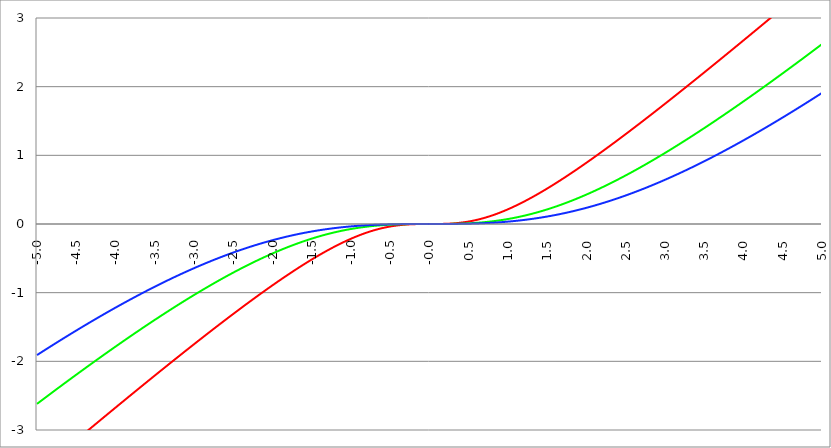
| Category | Series 1 | Series 0 | Series 2 |
|---|---|---|---|
| -5.0 | -3.627 | -2.619 | -1.909 |
| -4.995 | -3.622 | -2.615 | -1.905 |
| -4.99 | -3.617 | -2.611 | -1.902 |
| -4.985 | -3.612 | -2.606 | -1.898 |
| -4.98 | -3.607 | -2.602 | -1.894 |
| -4.975 | -3.603 | -2.598 | -1.891 |
| -4.97 | -3.598 | -2.594 | -1.887 |
| -4.965000000000001 | -3.593 | -2.589 | -1.883 |
| -4.960000000000001 | -3.588 | -2.585 | -1.88 |
| -4.955000000000001 | -3.583 | -2.581 | -1.876 |
| -4.950000000000001 | -3.579 | -2.576 | -1.872 |
| -4.945000000000001 | -3.574 | -2.572 | -1.869 |
| -4.940000000000001 | -3.569 | -2.568 | -1.865 |
| -4.935000000000001 | -3.564 | -2.563 | -1.861 |
| -4.930000000000001 | -3.559 | -2.559 | -1.858 |
| -4.925000000000002 | -3.555 | -2.555 | -1.854 |
| -4.920000000000002 | -3.55 | -2.551 | -1.85 |
| -4.915000000000002 | -3.545 | -2.546 | -1.847 |
| -4.910000000000002 | -3.54 | -2.542 | -1.843 |
| -4.905000000000002 | -3.535 | -2.538 | -1.839 |
| -4.900000000000002 | -3.531 | -2.533 | -1.836 |
| -4.895000000000002 | -3.526 | -2.529 | -1.832 |
| -4.890000000000002 | -3.521 | -2.525 | -1.828 |
| -4.885000000000002 | -3.516 | -2.521 | -1.825 |
| -4.880000000000002 | -3.511 | -2.516 | -1.821 |
| -4.875000000000003 | -3.507 | -2.512 | -1.818 |
| -4.870000000000003 | -3.502 | -2.508 | -1.814 |
| -4.865000000000003 | -3.497 | -2.503 | -1.81 |
| -4.860000000000003 | -3.492 | -2.499 | -1.807 |
| -4.855000000000003 | -3.487 | -2.495 | -1.803 |
| -4.850000000000003 | -3.483 | -2.491 | -1.799 |
| -4.845000000000003 | -3.478 | -2.486 | -1.796 |
| -4.840000000000003 | -3.473 | -2.482 | -1.792 |
| -4.835000000000003 | -3.468 | -2.478 | -1.789 |
| -4.830000000000004 | -3.463 | -2.474 | -1.785 |
| -4.825000000000004 | -3.459 | -2.469 | -1.781 |
| -4.820000000000004 | -3.454 | -2.465 | -1.778 |
| -4.815000000000004 | -3.449 | -2.461 | -1.774 |
| -4.810000000000004 | -3.444 | -2.457 | -1.771 |
| -4.805000000000004 | -3.439 | -2.452 | -1.767 |
| -4.800000000000004 | -3.435 | -2.448 | -1.763 |
| -4.795000000000004 | -3.43 | -2.444 | -1.76 |
| -4.790000000000004 | -3.425 | -2.439 | -1.756 |
| -4.785000000000004 | -3.42 | -2.435 | -1.753 |
| -4.780000000000004 | -3.415 | -2.431 | -1.749 |
| -4.775000000000004 | -3.411 | -2.427 | -1.745 |
| -4.770000000000004 | -3.406 | -2.422 | -1.742 |
| -4.765000000000005 | -3.401 | -2.418 | -1.738 |
| -4.760000000000005 | -3.396 | -2.414 | -1.735 |
| -4.755000000000005 | -3.391 | -2.41 | -1.731 |
| -4.750000000000005 | -3.387 | -2.405 | -1.728 |
| -4.745000000000005 | -3.382 | -2.401 | -1.724 |
| -4.740000000000005 | -3.377 | -2.397 | -1.72 |
| -4.735000000000005 | -3.372 | -2.393 | -1.717 |
| -4.730000000000005 | -3.368 | -2.388 | -1.713 |
| -4.725000000000006 | -3.363 | -2.384 | -1.71 |
| -4.720000000000006 | -3.358 | -2.38 | -1.706 |
| -4.715000000000006 | -3.353 | -2.376 | -1.703 |
| -4.710000000000006 | -3.348 | -2.372 | -1.699 |
| -4.705000000000006 | -3.344 | -2.367 | -1.695 |
| -4.700000000000006 | -3.339 | -2.363 | -1.692 |
| -4.695000000000006 | -3.334 | -2.359 | -1.688 |
| -4.690000000000006 | -3.329 | -2.355 | -1.685 |
| -4.685000000000007 | -3.324 | -2.35 | -1.681 |
| -4.680000000000007 | -3.32 | -2.346 | -1.678 |
| -4.675000000000007 | -3.315 | -2.342 | -1.674 |
| -4.670000000000007 | -3.31 | -2.338 | -1.671 |
| -4.665000000000007 | -3.305 | -2.333 | -1.667 |
| -4.660000000000007 | -3.301 | -2.329 | -1.664 |
| -4.655000000000007 | -3.296 | -2.325 | -1.66 |
| -4.650000000000007 | -3.291 | -2.321 | -1.657 |
| -4.645000000000007 | -3.286 | -2.317 | -1.653 |
| -4.640000000000008 | -3.281 | -2.312 | -1.649 |
| -4.635000000000008 | -3.277 | -2.308 | -1.646 |
| -4.630000000000008 | -3.272 | -2.304 | -1.642 |
| -4.625000000000008 | -3.267 | -2.3 | -1.639 |
| -4.620000000000008 | -3.262 | -2.295 | -1.635 |
| -4.615000000000008 | -3.258 | -2.291 | -1.632 |
| -4.610000000000008 | -3.253 | -2.287 | -1.628 |
| -4.605000000000008 | -3.248 | -2.283 | -1.625 |
| -4.600000000000008 | -3.243 | -2.279 | -1.621 |
| -4.595000000000009 | -3.238 | -2.274 | -1.618 |
| -4.590000000000009 | -3.234 | -2.27 | -1.614 |
| -4.585000000000009 | -3.229 | -2.266 | -1.611 |
| -4.580000000000009 | -3.224 | -2.262 | -1.607 |
| -4.57500000000001 | -3.219 | -2.258 | -1.604 |
| -4.57000000000001 | -3.215 | -2.253 | -1.6 |
| -4.565000000000009 | -3.21 | -2.249 | -1.597 |
| -4.560000000000009 | -3.205 | -2.245 | -1.593 |
| -4.555000000000009 | -3.2 | -2.241 | -1.59 |
| -4.55000000000001 | -3.196 | -2.237 | -1.586 |
| -4.54500000000001 | -3.191 | -2.232 | -1.583 |
| -4.54000000000001 | -3.186 | -2.228 | -1.579 |
| -4.53500000000001 | -3.181 | -2.224 | -1.576 |
| -4.53000000000001 | -3.176 | -2.22 | -1.572 |
| -4.52500000000001 | -3.172 | -2.216 | -1.569 |
| -4.52000000000001 | -3.167 | -2.212 | -1.565 |
| -4.51500000000001 | -3.162 | -2.207 | -1.562 |
| -4.51000000000001 | -3.157 | -2.203 | -1.559 |
| -4.505000000000011 | -3.153 | -2.199 | -1.555 |
| -4.500000000000011 | -3.148 | -2.195 | -1.552 |
| -4.495000000000011 | -3.143 | -2.191 | -1.548 |
| -4.490000000000011 | -3.138 | -2.187 | -1.545 |
| -4.485000000000011 | -3.134 | -2.182 | -1.541 |
| -4.480000000000011 | -3.129 | -2.178 | -1.538 |
| -4.475000000000011 | -3.124 | -2.174 | -1.534 |
| -4.470000000000011 | -3.119 | -2.17 | -1.531 |
| -4.465000000000011 | -3.115 | -2.166 | -1.527 |
| -4.460000000000011 | -3.11 | -2.162 | -1.524 |
| -4.455000000000012 | -3.105 | -2.157 | -1.521 |
| -4.450000000000012 | -3.1 | -2.153 | -1.517 |
| -4.445000000000012 | -3.095 | -2.149 | -1.514 |
| -4.440000000000012 | -3.091 | -2.145 | -1.51 |
| -4.435000000000012 | -3.086 | -2.141 | -1.507 |
| -4.430000000000012 | -3.081 | -2.137 | -1.503 |
| -4.425000000000012 | -3.076 | -2.132 | -1.5 |
| -4.420000000000012 | -3.072 | -2.128 | -1.497 |
| -4.415000000000012 | -3.067 | -2.124 | -1.493 |
| -4.410000000000013 | -3.062 | -2.12 | -1.49 |
| -4.405000000000013 | -3.057 | -2.116 | -1.486 |
| -4.400000000000013 | -3.053 | -2.112 | -1.483 |
| -4.395000000000013 | -3.048 | -2.108 | -1.479 |
| -4.390000000000013 | -3.043 | -2.103 | -1.476 |
| -4.385000000000013 | -3.038 | -2.099 | -1.473 |
| -4.380000000000013 | -3.034 | -2.095 | -1.469 |
| -4.375000000000013 | -3.029 | -2.091 | -1.466 |
| -4.370000000000013 | -3.024 | -2.087 | -1.462 |
| -4.365000000000013 | -3.019 | -2.083 | -1.459 |
| -4.360000000000014 | -3.015 | -2.079 | -1.456 |
| -4.355000000000014 | -3.01 | -2.074 | -1.452 |
| -4.350000000000014 | -3.005 | -2.07 | -1.449 |
| -4.345000000000014 | -3 | -2.066 | -1.445 |
| -4.340000000000014 | -2.996 | -2.062 | -1.442 |
| -4.335000000000014 | -2.991 | -2.058 | -1.439 |
| -4.330000000000014 | -2.986 | -2.054 | -1.435 |
| -4.325000000000014 | -2.981 | -2.05 | -1.432 |
| -4.320000000000014 | -2.977 | -2.046 | -1.429 |
| -4.315000000000015 | -2.972 | -2.041 | -1.425 |
| -4.310000000000015 | -2.967 | -2.037 | -1.422 |
| -4.305000000000015 | -2.962 | -2.033 | -1.418 |
| -4.300000000000015 | -2.958 | -2.029 | -1.415 |
| -4.295000000000015 | -2.953 | -2.025 | -1.412 |
| -4.290000000000015 | -2.948 | -2.021 | -1.408 |
| -4.285000000000015 | -2.943 | -2.017 | -1.405 |
| -4.280000000000015 | -2.939 | -2.013 | -1.402 |
| -4.275000000000015 | -2.934 | -2.009 | -1.398 |
| -4.270000000000015 | -2.929 | -2.004 | -1.395 |
| -4.265000000000016 | -2.925 | -2 | -1.392 |
| -4.260000000000016 | -2.92 | -1.996 | -1.388 |
| -4.255000000000016 | -2.915 | -1.992 | -1.385 |
| -4.250000000000016 | -2.91 | -1.988 | -1.382 |
| -4.245000000000016 | -2.906 | -1.984 | -1.378 |
| -4.240000000000016 | -2.901 | -1.98 | -1.375 |
| -4.235000000000016 | -2.896 | -1.976 | -1.372 |
| -4.230000000000016 | -2.891 | -1.972 | -1.368 |
| -4.225000000000017 | -2.887 | -1.968 | -1.365 |
| -4.220000000000017 | -2.882 | -1.964 | -1.362 |
| -4.215000000000017 | -2.877 | -1.959 | -1.358 |
| -4.210000000000017 | -2.872 | -1.955 | -1.355 |
| -4.205000000000017 | -2.868 | -1.951 | -1.352 |
| -4.200000000000017 | -2.863 | -1.947 | -1.348 |
| -4.195000000000017 | -2.858 | -1.943 | -1.345 |
| -4.190000000000017 | -2.853 | -1.939 | -1.342 |
| -4.185000000000017 | -2.849 | -1.935 | -1.338 |
| -4.180000000000017 | -2.844 | -1.931 | -1.335 |
| -4.175000000000018 | -2.839 | -1.927 | -1.332 |
| -4.170000000000018 | -2.835 | -1.923 | -1.329 |
| -4.165000000000018 | -2.83 | -1.919 | -1.325 |
| -4.160000000000018 | -2.825 | -1.915 | -1.322 |
| -4.155000000000018 | -2.82 | -1.911 | -1.319 |
| -4.150000000000018 | -2.816 | -1.907 | -1.315 |
| -4.145000000000018 | -2.811 | -1.903 | -1.312 |
| -4.140000000000018 | -2.806 | -1.898 | -1.309 |
| -4.135000000000018 | -2.801 | -1.894 | -1.306 |
| -4.130000000000019 | -2.797 | -1.89 | -1.302 |
| -4.125000000000019 | -2.792 | -1.886 | -1.299 |
| -4.120000000000019 | -2.787 | -1.882 | -1.296 |
| -4.115000000000019 | -2.783 | -1.878 | -1.292 |
| -4.110000000000019 | -2.778 | -1.874 | -1.289 |
| -4.105000000000019 | -2.773 | -1.87 | -1.286 |
| -4.100000000000019 | -2.768 | -1.866 | -1.283 |
| -4.095000000000019 | -2.764 | -1.862 | -1.279 |
| -4.090000000000019 | -2.759 | -1.858 | -1.276 |
| -4.085000000000019 | -2.754 | -1.854 | -1.273 |
| -4.08000000000002 | -2.75 | -1.85 | -1.27 |
| -4.07500000000002 | -2.745 | -1.846 | -1.266 |
| -4.07000000000002 | -2.74 | -1.842 | -1.263 |
| -4.06500000000002 | -2.735 | -1.838 | -1.26 |
| -4.06000000000002 | -2.731 | -1.834 | -1.257 |
| -4.05500000000002 | -2.726 | -1.83 | -1.253 |
| -4.05000000000002 | -2.721 | -1.826 | -1.25 |
| -4.04500000000002 | -2.717 | -1.822 | -1.247 |
| -4.04000000000002 | -2.712 | -1.818 | -1.244 |
| -4.03500000000002 | -2.707 | -1.814 | -1.241 |
| -4.03000000000002 | -2.702 | -1.81 | -1.237 |
| -4.025000000000021 | -2.698 | -1.806 | -1.234 |
| -4.020000000000021 | -2.693 | -1.802 | -1.231 |
| -4.015000000000021 | -2.688 | -1.798 | -1.228 |
| -4.010000000000021 | -2.684 | -1.794 | -1.225 |
| -4.005000000000021 | -2.679 | -1.79 | -1.221 |
| -4.000000000000021 | -2.674 | -1.786 | -1.218 |
| -3.995000000000021 | -2.669 | -1.782 | -1.215 |
| -3.990000000000021 | -2.665 | -1.778 | -1.212 |
| -3.985000000000022 | -2.66 | -1.774 | -1.209 |
| -3.980000000000022 | -2.655 | -1.77 | -1.205 |
| -3.975000000000022 | -2.651 | -1.766 | -1.202 |
| -3.970000000000022 | -2.646 | -1.762 | -1.199 |
| -3.965000000000022 | -2.641 | -1.758 | -1.196 |
| -3.960000000000022 | -2.637 | -1.754 | -1.193 |
| -3.955000000000022 | -2.632 | -1.75 | -1.189 |
| -3.950000000000022 | -2.627 | -1.746 | -1.186 |
| -3.945000000000022 | -2.622 | -1.742 | -1.183 |
| -3.940000000000023 | -2.618 | -1.738 | -1.18 |
| -3.935000000000023 | -2.613 | -1.734 | -1.177 |
| -3.930000000000023 | -2.608 | -1.73 | -1.174 |
| -3.925000000000023 | -2.604 | -1.726 | -1.17 |
| -3.920000000000023 | -2.599 | -1.722 | -1.167 |
| -3.915000000000023 | -2.594 | -1.718 | -1.164 |
| -3.910000000000023 | -2.59 | -1.714 | -1.161 |
| -3.905000000000023 | -2.585 | -1.71 | -1.158 |
| -3.900000000000023 | -2.58 | -1.706 | -1.155 |
| -3.895000000000023 | -2.576 | -1.702 | -1.152 |
| -3.890000000000024 | -2.571 | -1.698 | -1.148 |
| -3.885000000000024 | -2.566 | -1.694 | -1.145 |
| -3.880000000000024 | -2.561 | -1.69 | -1.142 |
| -3.875000000000024 | -2.557 | -1.686 | -1.139 |
| -3.870000000000024 | -2.552 | -1.682 | -1.136 |
| -3.865000000000024 | -2.547 | -1.678 | -1.133 |
| -3.860000000000024 | -2.543 | -1.675 | -1.13 |
| -3.855000000000024 | -2.538 | -1.671 | -1.127 |
| -3.850000000000024 | -2.533 | -1.667 | -1.123 |
| -3.845000000000025 | -2.529 | -1.663 | -1.12 |
| -3.840000000000025 | -2.524 | -1.659 | -1.117 |
| -3.835000000000025 | -2.519 | -1.655 | -1.114 |
| -3.830000000000025 | -2.515 | -1.651 | -1.111 |
| -3.825000000000025 | -2.51 | -1.647 | -1.108 |
| -3.820000000000025 | -2.505 | -1.643 | -1.105 |
| -3.815000000000025 | -2.501 | -1.639 | -1.102 |
| -3.810000000000025 | -2.496 | -1.635 | -1.099 |
| -3.805000000000025 | -2.491 | -1.631 | -1.096 |
| -3.800000000000026 | -2.487 | -1.627 | -1.092 |
| -3.795000000000026 | -2.482 | -1.623 | -1.089 |
| -3.790000000000026 | -2.477 | -1.62 | -1.086 |
| -3.785000000000026 | -2.473 | -1.616 | -1.083 |
| -3.780000000000026 | -2.468 | -1.612 | -1.08 |
| -3.775000000000026 | -2.463 | -1.608 | -1.077 |
| -3.770000000000026 | -2.458 | -1.604 | -1.074 |
| -3.765000000000026 | -2.454 | -1.6 | -1.071 |
| -3.760000000000026 | -2.449 | -1.596 | -1.068 |
| -3.755000000000026 | -2.444 | -1.592 | -1.065 |
| -3.750000000000027 | -2.44 | -1.588 | -1.062 |
| -3.745000000000027 | -2.435 | -1.584 | -1.059 |
| -3.740000000000027 | -2.43 | -1.581 | -1.056 |
| -3.735000000000027 | -2.426 | -1.577 | -1.053 |
| -3.730000000000027 | -2.421 | -1.573 | -1.05 |
| -3.725000000000027 | -2.416 | -1.569 | -1.047 |
| -3.720000000000027 | -2.412 | -1.565 | -1.044 |
| -3.715000000000027 | -2.407 | -1.561 | -1.041 |
| -3.710000000000027 | -2.402 | -1.557 | -1.038 |
| -3.705000000000028 | -2.398 | -1.553 | -1.035 |
| -3.700000000000028 | -2.393 | -1.55 | -1.032 |
| -3.695000000000028 | -2.389 | -1.546 | -1.028 |
| -3.690000000000028 | -2.384 | -1.542 | -1.025 |
| -3.685000000000028 | -2.379 | -1.538 | -1.022 |
| -3.680000000000028 | -2.375 | -1.534 | -1.019 |
| -3.675000000000028 | -2.37 | -1.53 | -1.016 |
| -3.670000000000028 | -2.365 | -1.526 | -1.013 |
| -3.665000000000028 | -2.361 | -1.522 | -1.01 |
| -3.660000000000028 | -2.356 | -1.519 | -1.007 |
| -3.655000000000029 | -2.351 | -1.515 | -1.004 |
| -3.650000000000029 | -2.347 | -1.511 | -1.002 |
| -3.645000000000029 | -2.342 | -1.507 | -0.999 |
| -3.640000000000029 | -2.337 | -1.503 | -0.996 |
| -3.635000000000029 | -2.333 | -1.499 | -0.993 |
| -3.630000000000029 | -2.328 | -1.496 | -0.99 |
| -3.625000000000029 | -2.323 | -1.492 | -0.987 |
| -3.620000000000029 | -2.319 | -1.488 | -0.984 |
| -3.615000000000029 | -2.314 | -1.484 | -0.981 |
| -3.61000000000003 | -2.309 | -1.48 | -0.978 |
| -3.60500000000003 | -2.305 | -1.476 | -0.975 |
| -3.60000000000003 | -2.3 | -1.473 | -0.972 |
| -3.59500000000003 | -2.296 | -1.469 | -0.969 |
| -3.59000000000003 | -2.291 | -1.465 | -0.966 |
| -3.58500000000003 | -2.286 | -1.461 | -0.963 |
| -3.58000000000003 | -2.282 | -1.457 | -0.96 |
| -3.57500000000003 | -2.277 | -1.454 | -0.957 |
| -3.57000000000003 | -2.272 | -1.45 | -0.954 |
| -3.565000000000031 | -2.268 | -1.446 | -0.951 |
| -3.560000000000031 | -2.263 | -1.442 | -0.948 |
| -3.555000000000031 | -2.258 | -1.438 | -0.945 |
| -3.550000000000031 | -2.254 | -1.435 | -0.942 |
| -3.545000000000031 | -2.249 | -1.431 | -0.94 |
| -3.540000000000031 | -2.245 | -1.427 | -0.937 |
| -3.535000000000031 | -2.24 | -1.423 | -0.934 |
| -3.530000000000031 | -2.235 | -1.419 | -0.931 |
| -3.525000000000031 | -2.231 | -1.416 | -0.928 |
| -3.520000000000032 | -2.226 | -1.412 | -0.925 |
| -3.515000000000032 | -2.221 | -1.408 | -0.922 |
| -3.510000000000032 | -2.217 | -1.404 | -0.919 |
| -3.505000000000032 | -2.212 | -1.4 | -0.916 |
| -3.500000000000032 | -2.208 | -1.397 | -0.913 |
| -3.495000000000032 | -2.203 | -1.393 | -0.911 |
| -3.490000000000032 | -2.198 | -1.389 | -0.908 |
| -3.485000000000032 | -2.194 | -1.385 | -0.905 |
| -3.480000000000032 | -2.189 | -1.382 | -0.902 |
| -3.475000000000032 | -2.184 | -1.378 | -0.899 |
| -3.470000000000033 | -2.18 | -1.374 | -0.896 |
| -3.465000000000033 | -2.175 | -1.37 | -0.893 |
| -3.460000000000033 | -2.171 | -1.367 | -0.891 |
| -3.455000000000033 | -2.166 | -1.363 | -0.888 |
| -3.450000000000033 | -2.161 | -1.359 | -0.885 |
| -3.445000000000033 | -2.157 | -1.355 | -0.882 |
| -3.440000000000033 | -2.152 | -1.352 | -0.879 |
| -3.435000000000033 | -2.147 | -1.348 | -0.876 |
| -3.430000000000033 | -2.143 | -1.344 | -0.873 |
| -3.425000000000034 | -2.138 | -1.34 | -0.871 |
| -3.420000000000034 | -2.134 | -1.337 | -0.868 |
| -3.415000000000034 | -2.129 | -1.333 | -0.865 |
| -3.410000000000034 | -2.124 | -1.329 | -0.862 |
| -3.405000000000034 | -2.12 | -1.326 | -0.859 |
| -3.400000000000034 | -2.115 | -1.322 | -0.857 |
| -3.395000000000034 | -2.111 | -1.318 | -0.854 |
| -3.390000000000034 | -2.106 | -1.314 | -0.851 |
| -3.385000000000034 | -2.101 | -1.311 | -0.848 |
| -3.380000000000034 | -2.097 | -1.307 | -0.845 |
| -3.375000000000035 | -2.092 | -1.303 | -0.843 |
| -3.370000000000035 | -2.088 | -1.3 | -0.84 |
| -3.365000000000035 | -2.083 | -1.296 | -0.837 |
| -3.360000000000035 | -2.078 | -1.292 | -0.834 |
| -3.355000000000035 | -2.074 | -1.289 | -0.831 |
| -3.350000000000035 | -2.069 | -1.285 | -0.829 |
| -3.345000000000035 | -2.065 | -1.281 | -0.826 |
| -3.340000000000035 | -2.06 | -1.277 | -0.823 |
| -3.335000000000035 | -2.056 | -1.274 | -0.82 |
| -3.330000000000036 | -2.051 | -1.27 | -0.818 |
| -3.325000000000036 | -2.046 | -1.266 | -0.815 |
| -3.320000000000036 | -2.042 | -1.263 | -0.812 |
| -3.315000000000036 | -2.037 | -1.259 | -0.809 |
| -3.310000000000036 | -2.033 | -1.255 | -0.807 |
| -3.305000000000036 | -2.028 | -1.252 | -0.804 |
| -3.300000000000036 | -2.023 | -1.248 | -0.801 |
| -3.295000000000036 | -2.019 | -1.244 | -0.798 |
| -3.290000000000036 | -2.014 | -1.241 | -0.796 |
| -3.285000000000036 | -2.01 | -1.237 | -0.793 |
| -3.280000000000036 | -2.005 | -1.234 | -0.79 |
| -3.275000000000037 | -2.001 | -1.23 | -0.787 |
| -3.270000000000037 | -1.996 | -1.226 | -0.785 |
| -3.265000000000037 | -1.991 | -1.223 | -0.782 |
| -3.260000000000037 | -1.987 | -1.219 | -0.779 |
| -3.255000000000037 | -1.982 | -1.215 | -0.777 |
| -3.250000000000037 | -1.978 | -1.212 | -0.774 |
| -3.245000000000037 | -1.973 | -1.208 | -0.771 |
| -3.240000000000037 | -1.969 | -1.204 | -0.768 |
| -3.235000000000038 | -1.964 | -1.201 | -0.766 |
| -3.230000000000038 | -1.959 | -1.197 | -0.763 |
| -3.225000000000038 | -1.955 | -1.194 | -0.76 |
| -3.220000000000038 | -1.95 | -1.19 | -0.758 |
| -3.215000000000038 | -1.946 | -1.186 | -0.755 |
| -3.210000000000038 | -1.941 | -1.183 | -0.752 |
| -3.205000000000038 | -1.937 | -1.179 | -0.75 |
| -3.200000000000038 | -1.932 | -1.176 | -0.747 |
| -3.195000000000038 | -1.928 | -1.172 | -0.744 |
| -3.190000000000039 | -1.923 | -1.168 | -0.742 |
| -3.185000000000039 | -1.918 | -1.165 | -0.739 |
| -3.180000000000039 | -1.914 | -1.161 | -0.736 |
| -3.175000000000039 | -1.909 | -1.158 | -0.734 |
| -3.170000000000039 | -1.905 | -1.154 | -0.731 |
| -3.16500000000004 | -1.9 | -1.151 | -0.729 |
| -3.16000000000004 | -1.896 | -1.147 | -0.726 |
| -3.155000000000039 | -1.891 | -1.143 | -0.723 |
| -3.150000000000039 | -1.887 | -1.14 | -0.721 |
| -3.14500000000004 | -1.882 | -1.136 | -0.718 |
| -3.14000000000004 | -1.878 | -1.133 | -0.715 |
| -3.13500000000004 | -1.873 | -1.129 | -0.713 |
| -3.13000000000004 | -1.868 | -1.126 | -0.71 |
| -3.12500000000004 | -1.864 | -1.122 | -0.708 |
| -3.12000000000004 | -1.859 | -1.118 | -0.705 |
| -3.11500000000004 | -1.855 | -1.115 | -0.702 |
| -3.11000000000004 | -1.85 | -1.111 | -0.7 |
| -3.10500000000004 | -1.846 | -1.108 | -0.697 |
| -3.10000000000004 | -1.841 | -1.104 | -0.695 |
| -3.095000000000041 | -1.837 | -1.101 | -0.692 |
| -3.090000000000041 | -1.832 | -1.097 | -0.689 |
| -3.085000000000041 | -1.828 | -1.094 | -0.687 |
| -3.080000000000041 | -1.823 | -1.09 | -0.684 |
| -3.075000000000041 | -1.819 | -1.087 | -0.682 |
| -3.070000000000041 | -1.814 | -1.083 | -0.679 |
| -3.065000000000041 | -1.81 | -1.08 | -0.677 |
| -3.060000000000041 | -1.805 | -1.076 | -0.674 |
| -3.055000000000041 | -1.801 | -1.073 | -0.672 |
| -3.050000000000042 | -1.796 | -1.069 | -0.669 |
| -3.045000000000042 | -1.792 | -1.066 | -0.666 |
| -3.040000000000042 | -1.787 | -1.062 | -0.664 |
| -3.035000000000042 | -1.782 | -1.059 | -0.661 |
| -3.030000000000042 | -1.778 | -1.055 | -0.659 |
| -3.025000000000042 | -1.773 | -1.052 | -0.656 |
| -3.020000000000042 | -1.769 | -1.048 | -0.654 |
| -3.015000000000042 | -1.764 | -1.045 | -0.651 |
| -3.010000000000042 | -1.76 | -1.041 | -0.649 |
| -3.005000000000043 | -1.755 | -1.038 | -0.646 |
| -3.000000000000043 | -1.751 | -1.034 | -0.644 |
| -2.995000000000043 | -1.746 | -1.031 | -0.641 |
| -2.990000000000043 | -1.742 | -1.027 | -0.639 |
| -2.985000000000043 | -1.737 | -1.024 | -0.636 |
| -2.980000000000043 | -1.733 | -1.021 | -0.634 |
| -2.975000000000043 | -1.728 | -1.017 | -0.631 |
| -2.970000000000043 | -1.724 | -1.014 | -0.629 |
| -2.965000000000043 | -1.719 | -1.01 | -0.626 |
| -2.960000000000043 | -1.715 | -1.007 | -0.624 |
| -2.955000000000044 | -1.711 | -1.003 | -0.621 |
| -2.950000000000044 | -1.706 | -1 | -0.619 |
| -2.945000000000044 | -1.702 | -0.997 | -0.617 |
| -2.940000000000044 | -1.697 | -0.993 | -0.614 |
| -2.935000000000044 | -1.693 | -0.99 | -0.612 |
| -2.930000000000044 | -1.688 | -0.986 | -0.609 |
| -2.925000000000044 | -1.684 | -0.983 | -0.607 |
| -2.920000000000044 | -1.679 | -0.979 | -0.604 |
| -2.915000000000044 | -1.675 | -0.976 | -0.602 |
| -2.910000000000045 | -1.67 | -0.973 | -0.599 |
| -2.905000000000045 | -1.666 | -0.969 | -0.597 |
| -2.900000000000045 | -1.661 | -0.966 | -0.595 |
| -2.895000000000045 | -1.657 | -0.963 | -0.592 |
| -2.890000000000045 | -1.652 | -0.959 | -0.59 |
| -2.885000000000045 | -1.648 | -0.956 | -0.587 |
| -2.880000000000045 | -1.643 | -0.952 | -0.585 |
| -2.875000000000045 | -1.639 | -0.949 | -0.583 |
| -2.870000000000045 | -1.634 | -0.946 | -0.58 |
| -2.865000000000045 | -1.63 | -0.942 | -0.578 |
| -2.860000000000046 | -1.626 | -0.939 | -0.575 |
| -2.855000000000046 | -1.621 | -0.936 | -0.573 |
| -2.850000000000046 | -1.617 | -0.932 | -0.571 |
| -2.845000000000046 | -1.612 | -0.929 | -0.568 |
| -2.840000000000046 | -1.608 | -0.926 | -0.566 |
| -2.835000000000046 | -1.603 | -0.922 | -0.564 |
| -2.830000000000046 | -1.599 | -0.919 | -0.561 |
| -2.825000000000046 | -1.594 | -0.916 | -0.559 |
| -2.820000000000046 | -1.59 | -0.912 | -0.557 |
| -2.815000000000047 | -1.586 | -0.909 | -0.554 |
| -2.810000000000047 | -1.581 | -0.906 | -0.552 |
| -2.805000000000047 | -1.577 | -0.902 | -0.55 |
| -2.800000000000047 | -1.572 | -0.899 | -0.547 |
| -2.795000000000047 | -1.568 | -0.896 | -0.545 |
| -2.790000000000047 | -1.563 | -0.892 | -0.543 |
| -2.785000000000047 | -1.559 | -0.889 | -0.54 |
| -2.780000000000047 | -1.555 | -0.886 | -0.538 |
| -2.775000000000047 | -1.55 | -0.882 | -0.536 |
| -2.770000000000047 | -1.546 | -0.879 | -0.533 |
| -2.765000000000048 | -1.541 | -0.876 | -0.531 |
| -2.760000000000048 | -1.537 | -0.873 | -0.529 |
| -2.755000000000048 | -1.532 | -0.869 | -0.526 |
| -2.750000000000048 | -1.528 | -0.866 | -0.524 |
| -2.745000000000048 | -1.524 | -0.863 | -0.522 |
| -2.740000000000048 | -1.519 | -0.859 | -0.52 |
| -2.735000000000048 | -1.515 | -0.856 | -0.517 |
| -2.730000000000048 | -1.51 | -0.853 | -0.515 |
| -2.725000000000048 | -1.506 | -0.85 | -0.513 |
| -2.720000000000049 | -1.502 | -0.846 | -0.511 |
| -2.715000000000049 | -1.497 | -0.843 | -0.508 |
| -2.710000000000049 | -1.493 | -0.84 | -0.506 |
| -2.705000000000049 | -1.488 | -0.837 | -0.504 |
| -2.700000000000049 | -1.484 | -0.834 | -0.502 |
| -2.695000000000049 | -1.48 | -0.83 | -0.499 |
| -2.690000000000049 | -1.475 | -0.827 | -0.497 |
| -2.685000000000049 | -1.471 | -0.824 | -0.495 |
| -2.680000000000049 | -1.466 | -0.821 | -0.493 |
| -2.675000000000049 | -1.462 | -0.817 | -0.49 |
| -2.67000000000005 | -1.458 | -0.814 | -0.488 |
| -2.66500000000005 | -1.453 | -0.811 | -0.486 |
| -2.66000000000005 | -1.449 | -0.808 | -0.484 |
| -2.65500000000005 | -1.444 | -0.805 | -0.482 |
| -2.65000000000005 | -1.44 | -0.801 | -0.479 |
| -2.64500000000005 | -1.436 | -0.798 | -0.477 |
| -2.64000000000005 | -1.431 | -0.795 | -0.475 |
| -2.63500000000005 | -1.427 | -0.792 | -0.473 |
| -2.63000000000005 | -1.423 | -0.789 | -0.471 |
| -2.625000000000051 | -1.418 | -0.786 | -0.469 |
| -2.620000000000051 | -1.414 | -0.782 | -0.466 |
| -2.615000000000051 | -1.409 | -0.779 | -0.464 |
| -2.610000000000051 | -1.405 | -0.776 | -0.462 |
| -2.605000000000051 | -1.401 | -0.773 | -0.46 |
| -2.600000000000051 | -1.396 | -0.77 | -0.458 |
| -2.595000000000051 | -1.392 | -0.767 | -0.456 |
| -2.590000000000051 | -1.388 | -0.764 | -0.453 |
| -2.585000000000051 | -1.383 | -0.76 | -0.451 |
| -2.580000000000052 | -1.379 | -0.757 | -0.449 |
| -2.575000000000052 | -1.375 | -0.754 | -0.447 |
| -2.570000000000052 | -1.37 | -0.751 | -0.445 |
| -2.565000000000052 | -1.366 | -0.748 | -0.443 |
| -2.560000000000052 | -1.362 | -0.745 | -0.441 |
| -2.555000000000052 | -1.357 | -0.742 | -0.439 |
| -2.550000000000052 | -1.353 | -0.739 | -0.437 |
| -2.545000000000052 | -1.349 | -0.736 | -0.434 |
| -2.540000000000052 | -1.344 | -0.732 | -0.432 |
| -2.535000000000053 | -1.34 | -0.729 | -0.43 |
| -2.530000000000053 | -1.336 | -0.726 | -0.428 |
| -2.525000000000053 | -1.331 | -0.723 | -0.426 |
| -2.520000000000053 | -1.327 | -0.72 | -0.424 |
| -2.515000000000053 | -1.323 | -0.717 | -0.422 |
| -2.510000000000053 | -1.318 | -0.714 | -0.42 |
| -2.505000000000053 | -1.314 | -0.711 | -0.418 |
| -2.500000000000053 | -1.31 | -0.708 | -0.416 |
| -2.495000000000053 | -1.305 | -0.705 | -0.414 |
| -2.490000000000053 | -1.301 | -0.702 | -0.412 |
| -2.485000000000054 | -1.297 | -0.699 | -0.41 |
| -2.480000000000054 | -1.292 | -0.696 | -0.408 |
| -2.475000000000054 | -1.288 | -0.693 | -0.406 |
| -2.470000000000054 | -1.284 | -0.69 | -0.404 |
| -2.465000000000054 | -1.28 | -0.687 | -0.402 |
| -2.460000000000054 | -1.275 | -0.684 | -0.4 |
| -2.455000000000054 | -1.271 | -0.681 | -0.398 |
| -2.450000000000054 | -1.267 | -0.678 | -0.396 |
| -2.445000000000054 | -1.262 | -0.675 | -0.394 |
| -2.440000000000055 | -1.258 | -0.672 | -0.392 |
| -2.435000000000055 | -1.254 | -0.669 | -0.39 |
| -2.430000000000055 | -1.25 | -0.666 | -0.388 |
| -2.425000000000055 | -1.245 | -0.663 | -0.386 |
| -2.420000000000055 | -1.241 | -0.66 | -0.384 |
| -2.415000000000055 | -1.237 | -0.657 | -0.382 |
| -2.410000000000055 | -1.233 | -0.654 | -0.38 |
| -2.405000000000055 | -1.228 | -0.651 | -0.378 |
| -2.400000000000055 | -1.224 | -0.648 | -0.376 |
| -2.395000000000055 | -1.22 | -0.645 | -0.374 |
| -2.390000000000056 | -1.215 | -0.642 | -0.372 |
| -2.385000000000056 | -1.211 | -0.639 | -0.37 |
| -2.380000000000056 | -1.207 | -0.636 | -0.368 |
| -2.375000000000056 | -1.203 | -0.633 | -0.366 |
| -2.370000000000056 | -1.198 | -0.63 | -0.364 |
| -2.365000000000056 | -1.194 | -0.627 | -0.362 |
| -2.360000000000056 | -1.19 | -0.624 | -0.36 |
| -2.355000000000056 | -1.186 | -0.622 | -0.358 |
| -2.350000000000056 | -1.182 | -0.619 | -0.357 |
| -2.345000000000057 | -1.177 | -0.616 | -0.355 |
| -2.340000000000057 | -1.173 | -0.613 | -0.353 |
| -2.335000000000057 | -1.169 | -0.61 | -0.351 |
| -2.330000000000057 | -1.165 | -0.607 | -0.349 |
| -2.325000000000057 | -1.16 | -0.604 | -0.347 |
| -2.320000000000057 | -1.156 | -0.601 | -0.345 |
| -2.315000000000057 | -1.152 | -0.598 | -0.343 |
| -2.310000000000057 | -1.148 | -0.596 | -0.341 |
| -2.305000000000057 | -1.144 | -0.593 | -0.34 |
| -2.300000000000058 | -1.139 | -0.59 | -0.338 |
| -2.295000000000058 | -1.135 | -0.587 | -0.336 |
| -2.290000000000058 | -1.131 | -0.584 | -0.334 |
| -2.285000000000058 | -1.127 | -0.581 | -0.332 |
| -2.280000000000058 | -1.123 | -0.579 | -0.33 |
| -2.275000000000058 | -1.118 | -0.576 | -0.329 |
| -2.270000000000058 | -1.114 | -0.573 | -0.327 |
| -2.265000000000058 | -1.11 | -0.57 | -0.325 |
| -2.260000000000058 | -1.106 | -0.567 | -0.323 |
| -2.255000000000058 | -1.102 | -0.564 | -0.321 |
| -2.250000000000059 | -1.097 | -0.562 | -0.319 |
| -2.245000000000059 | -1.093 | -0.559 | -0.318 |
| -2.240000000000059 | -1.089 | -0.556 | -0.316 |
| -2.235000000000059 | -1.085 | -0.553 | -0.314 |
| -2.23000000000006 | -1.081 | -0.551 | -0.312 |
| -2.22500000000006 | -1.077 | -0.548 | -0.311 |
| -2.22000000000006 | -1.072 | -0.545 | -0.309 |
| -2.215000000000059 | -1.068 | -0.542 | -0.307 |
| -2.210000000000059 | -1.064 | -0.54 | -0.305 |
| -2.20500000000006 | -1.06 | -0.537 | -0.304 |
| -2.20000000000006 | -1.056 | -0.534 | -0.302 |
| -2.19500000000006 | -1.052 | -0.531 | -0.3 |
| -2.19000000000006 | -1.048 | -0.529 | -0.298 |
| -2.18500000000006 | -1.043 | -0.526 | -0.297 |
| -2.18000000000006 | -1.039 | -0.523 | -0.295 |
| -2.17500000000006 | -1.035 | -0.52 | -0.293 |
| -2.17000000000006 | -1.031 | -0.518 | -0.291 |
| -2.16500000000006 | -1.027 | -0.515 | -0.29 |
| -2.160000000000061 | -1.023 | -0.512 | -0.288 |
| -2.155000000000061 | -1.019 | -0.51 | -0.286 |
| -2.150000000000061 | -1.015 | -0.507 | -0.285 |
| -2.145000000000061 | -1.01 | -0.504 | -0.283 |
| -2.140000000000061 | -1.006 | -0.502 | -0.281 |
| -2.135000000000061 | -1.002 | -0.499 | -0.279 |
| -2.130000000000061 | -0.998 | -0.496 | -0.278 |
| -2.125000000000061 | -0.994 | -0.494 | -0.276 |
| -2.120000000000061 | -0.99 | -0.491 | -0.274 |
| -2.115000000000061 | -0.986 | -0.488 | -0.273 |
| -2.110000000000062 | -0.982 | -0.486 | -0.271 |
| -2.105000000000062 | -0.978 | -0.483 | -0.269 |
| -2.100000000000062 | -0.974 | -0.48 | -0.268 |
| -2.095000000000062 | -0.97 | -0.478 | -0.266 |
| -2.090000000000062 | -0.965 | -0.475 | -0.265 |
| -2.085000000000062 | -0.961 | -0.473 | -0.263 |
| -2.080000000000062 | -0.957 | -0.47 | -0.261 |
| -2.075000000000062 | -0.953 | -0.467 | -0.26 |
| -2.070000000000062 | -0.949 | -0.465 | -0.258 |
| -2.065000000000063 | -0.945 | -0.462 | -0.256 |
| -2.060000000000063 | -0.941 | -0.46 | -0.255 |
| -2.055000000000063 | -0.937 | -0.457 | -0.253 |
| -2.050000000000063 | -0.933 | -0.455 | -0.252 |
| -2.045000000000063 | -0.929 | -0.452 | -0.25 |
| -2.040000000000063 | -0.925 | -0.449 | -0.248 |
| -2.035000000000063 | -0.921 | -0.447 | -0.247 |
| -2.030000000000063 | -0.917 | -0.444 | -0.245 |
| -2.025000000000063 | -0.913 | -0.442 | -0.244 |
| -2.020000000000064 | -0.909 | -0.439 | -0.242 |
| -2.015000000000064 | -0.905 | -0.437 | -0.241 |
| -2.010000000000064 | -0.901 | -0.434 | -0.239 |
| -2.005000000000064 | -0.897 | -0.432 | -0.238 |
| -2.000000000000064 | -0.893 | -0.429 | -0.236 |
| -1.995000000000064 | -0.889 | -0.427 | -0.234 |
| -1.990000000000064 | -0.885 | -0.424 | -0.233 |
| -1.985000000000064 | -0.881 | -0.422 | -0.231 |
| -1.980000000000064 | -0.877 | -0.419 | -0.23 |
| -1.975000000000064 | -0.873 | -0.417 | -0.228 |
| -1.970000000000065 | -0.869 | -0.414 | -0.227 |
| -1.965000000000065 | -0.865 | -0.412 | -0.225 |
| -1.960000000000065 | -0.861 | -0.409 | -0.224 |
| -1.955000000000065 | -0.857 | -0.407 | -0.222 |
| -1.950000000000065 | -0.853 | -0.405 | -0.221 |
| -1.945000000000065 | -0.849 | -0.402 | -0.219 |
| -1.940000000000065 | -0.845 | -0.4 | -0.218 |
| -1.935000000000065 | -0.841 | -0.397 | -0.216 |
| -1.930000000000065 | -0.837 | -0.395 | -0.215 |
| -1.925000000000066 | -0.833 | -0.392 | -0.214 |
| -1.920000000000066 | -0.829 | -0.39 | -0.212 |
| -1.915000000000066 | -0.825 | -0.388 | -0.211 |
| -1.910000000000066 | -0.822 | -0.385 | -0.209 |
| -1.905000000000066 | -0.818 | -0.383 | -0.208 |
| -1.900000000000066 | -0.814 | -0.38 | -0.206 |
| -1.895000000000066 | -0.81 | -0.378 | -0.205 |
| -1.890000000000066 | -0.806 | -0.376 | -0.203 |
| -1.885000000000066 | -0.802 | -0.373 | -0.202 |
| -1.880000000000066 | -0.798 | -0.371 | -0.201 |
| -1.875000000000067 | -0.794 | -0.369 | -0.199 |
| -1.870000000000067 | -0.79 | -0.366 | -0.198 |
| -1.865000000000067 | -0.786 | -0.364 | -0.196 |
| -1.860000000000067 | -0.783 | -0.362 | -0.195 |
| -1.855000000000067 | -0.779 | -0.359 | -0.194 |
| -1.850000000000067 | -0.775 | -0.357 | -0.192 |
| -1.845000000000067 | -0.771 | -0.355 | -0.191 |
| -1.840000000000067 | -0.767 | -0.352 | -0.19 |
| -1.835000000000067 | -0.763 | -0.35 | -0.188 |
| -1.830000000000068 | -0.759 | -0.348 | -0.187 |
| -1.825000000000068 | -0.755 | -0.346 | -0.185 |
| -1.820000000000068 | -0.752 | -0.343 | -0.184 |
| -1.815000000000068 | -0.748 | -0.341 | -0.183 |
| -1.810000000000068 | -0.744 | -0.339 | -0.181 |
| -1.805000000000068 | -0.74 | -0.337 | -0.18 |
| -1.800000000000068 | -0.736 | -0.334 | -0.179 |
| -1.795000000000068 | -0.732 | -0.332 | -0.177 |
| -1.790000000000068 | -0.729 | -0.33 | -0.176 |
| -1.785000000000068 | -0.725 | -0.328 | -0.175 |
| -1.780000000000069 | -0.721 | -0.325 | -0.173 |
| -1.775000000000069 | -0.717 | -0.323 | -0.172 |
| -1.770000000000069 | -0.713 | -0.321 | -0.171 |
| -1.765000000000069 | -0.71 | -0.319 | -0.17 |
| -1.760000000000069 | -0.706 | -0.317 | -0.168 |
| -1.75500000000007 | -0.702 | -0.315 | -0.167 |
| -1.75000000000007 | -0.698 | -0.312 | -0.166 |
| -1.745000000000069 | -0.695 | -0.31 | -0.165 |
| -1.740000000000069 | -0.691 | -0.308 | -0.163 |
| -1.73500000000007 | -0.687 | -0.306 | -0.162 |
| -1.73000000000007 | -0.683 | -0.304 | -0.161 |
| -1.72500000000007 | -0.68 | -0.302 | -0.159 |
| -1.72000000000007 | -0.676 | -0.299 | -0.158 |
| -1.71500000000007 | -0.672 | -0.297 | -0.157 |
| -1.71000000000007 | -0.668 | -0.295 | -0.156 |
| -1.70500000000007 | -0.665 | -0.293 | -0.155 |
| -1.70000000000007 | -0.661 | -0.291 | -0.153 |
| -1.69500000000007 | -0.657 | -0.289 | -0.152 |
| -1.69000000000007 | -0.654 | -0.287 | -0.151 |
| -1.685000000000071 | -0.65 | -0.285 | -0.15 |
| -1.680000000000071 | -0.646 | -0.283 | -0.149 |
| -1.675000000000071 | -0.642 | -0.281 | -0.147 |
| -1.670000000000071 | -0.639 | -0.279 | -0.146 |
| -1.665000000000071 | -0.635 | -0.277 | -0.145 |
| -1.660000000000071 | -0.631 | -0.274 | -0.144 |
| -1.655000000000071 | -0.628 | -0.272 | -0.143 |
| -1.650000000000071 | -0.624 | -0.27 | -0.141 |
| -1.645000000000071 | -0.62 | -0.268 | -0.14 |
| -1.640000000000072 | -0.617 | -0.266 | -0.139 |
| -1.635000000000072 | -0.613 | -0.264 | -0.138 |
| -1.630000000000072 | -0.609 | -0.262 | -0.137 |
| -1.625000000000072 | -0.606 | -0.26 | -0.136 |
| -1.620000000000072 | -0.602 | -0.258 | -0.135 |
| -1.615000000000072 | -0.599 | -0.256 | -0.133 |
| -1.610000000000072 | -0.595 | -0.254 | -0.132 |
| -1.605000000000072 | -0.591 | -0.252 | -0.131 |
| -1.600000000000072 | -0.588 | -0.251 | -0.13 |
| -1.595000000000073 | -0.584 | -0.249 | -0.129 |
| -1.590000000000073 | -0.581 | -0.247 | -0.128 |
| -1.585000000000073 | -0.577 | -0.245 | -0.127 |
| -1.580000000000073 | -0.573 | -0.243 | -0.126 |
| -1.575000000000073 | -0.57 | -0.241 | -0.125 |
| -1.570000000000073 | -0.566 | -0.239 | -0.124 |
| -1.565000000000073 | -0.563 | -0.237 | -0.123 |
| -1.560000000000073 | -0.559 | -0.235 | -0.121 |
| -1.555000000000073 | -0.556 | -0.233 | -0.12 |
| -1.550000000000074 | -0.552 | -0.231 | -0.119 |
| -1.545000000000074 | -0.549 | -0.23 | -0.118 |
| -1.540000000000074 | -0.545 | -0.228 | -0.117 |
| -1.535000000000074 | -0.542 | -0.226 | -0.116 |
| -1.530000000000074 | -0.538 | -0.224 | -0.115 |
| -1.525000000000074 | -0.535 | -0.222 | -0.114 |
| -1.520000000000074 | -0.531 | -0.22 | -0.113 |
| -1.515000000000074 | -0.528 | -0.218 | -0.112 |
| -1.510000000000074 | -0.524 | -0.217 | -0.111 |
| -1.505000000000074 | -0.521 | -0.215 | -0.11 |
| -1.500000000000075 | -0.517 | -0.213 | -0.109 |
| -1.495000000000075 | -0.514 | -0.211 | -0.108 |
| -1.490000000000075 | -0.51 | -0.209 | -0.107 |
| -1.485000000000075 | -0.507 | -0.208 | -0.106 |
| -1.480000000000075 | -0.503 | -0.206 | -0.105 |
| -1.475000000000075 | -0.5 | -0.204 | -0.104 |
| -1.470000000000075 | -0.497 | -0.202 | -0.103 |
| -1.465000000000075 | -0.493 | -0.201 | -0.102 |
| -1.460000000000075 | -0.49 | -0.199 | -0.101 |
| -1.455000000000076 | -0.486 | -0.197 | -0.1 |
| -1.450000000000076 | -0.483 | -0.195 | -0.099 |
| -1.445000000000076 | -0.48 | -0.194 | -0.098 |
| -1.440000000000076 | -0.476 | -0.192 | -0.097 |
| -1.435000000000076 | -0.473 | -0.19 | -0.097 |
| -1.430000000000076 | -0.469 | -0.189 | -0.096 |
| -1.425000000000076 | -0.466 | -0.187 | -0.095 |
| -1.420000000000076 | -0.463 | -0.185 | -0.094 |
| -1.415000000000076 | -0.459 | -0.184 | -0.093 |
| -1.410000000000077 | -0.456 | -0.182 | -0.092 |
| -1.405000000000077 | -0.453 | -0.18 | -0.091 |
| -1.400000000000077 | -0.449 | -0.179 | -0.09 |
| -1.395000000000077 | -0.446 | -0.177 | -0.089 |
| -1.390000000000077 | -0.443 | -0.175 | -0.088 |
| -1.385000000000077 | -0.44 | -0.174 | -0.087 |
| -1.380000000000077 | -0.436 | -0.172 | -0.087 |
| -1.375000000000077 | -0.433 | -0.17 | -0.086 |
| -1.370000000000077 | -0.43 | -0.169 | -0.085 |
| -1.365000000000077 | -0.426 | -0.167 | -0.084 |
| -1.360000000000078 | -0.423 | -0.166 | -0.083 |
| -1.355000000000078 | -0.42 | -0.164 | -0.082 |
| -1.350000000000078 | -0.417 | -0.163 | -0.081 |
| -1.345000000000078 | -0.414 | -0.161 | -0.081 |
| -1.340000000000078 | -0.41 | -0.159 | -0.08 |
| -1.335000000000078 | -0.407 | -0.158 | -0.079 |
| -1.330000000000078 | -0.404 | -0.156 | -0.078 |
| -1.325000000000078 | -0.401 | -0.155 | -0.077 |
| -1.320000000000078 | -0.398 | -0.153 | -0.076 |
| -1.315000000000079 | -0.394 | -0.152 | -0.076 |
| -1.310000000000079 | -0.391 | -0.15 | -0.075 |
| -1.305000000000079 | -0.388 | -0.149 | -0.074 |
| -1.300000000000079 | -0.385 | -0.147 | -0.073 |
| -1.295000000000079 | -0.382 | -0.146 | -0.072 |
| -1.29000000000008 | -0.379 | -0.144 | -0.072 |
| -1.285000000000079 | -0.376 | -0.143 | -0.071 |
| -1.280000000000079 | -0.372 | -0.141 | -0.07 |
| -1.275000000000079 | -0.369 | -0.14 | -0.069 |
| -1.270000000000079 | -0.366 | -0.138 | -0.069 |
| -1.26500000000008 | -0.363 | -0.137 | -0.068 |
| -1.26000000000008 | -0.36 | -0.136 | -0.067 |
| -1.25500000000008 | -0.357 | -0.134 | -0.066 |
| -1.25000000000008 | -0.354 | -0.133 | -0.066 |
| -1.24500000000008 | -0.351 | -0.131 | -0.065 |
| -1.24000000000008 | -0.348 | -0.13 | -0.064 |
| -1.23500000000008 | -0.345 | -0.129 | -0.063 |
| -1.23000000000008 | -0.342 | -0.127 | -0.063 |
| -1.22500000000008 | -0.339 | -0.126 | -0.062 |
| -1.220000000000081 | -0.336 | -0.125 | -0.061 |
| -1.215000000000081 | -0.333 | -0.123 | -0.061 |
| -1.210000000000081 | -0.33 | -0.122 | -0.06 |
| -1.205000000000081 | -0.327 | -0.12 | -0.059 |
| -1.200000000000081 | -0.324 | -0.119 | -0.058 |
| -1.195000000000081 | -0.321 | -0.118 | -0.058 |
| -1.190000000000081 | -0.318 | -0.117 | -0.057 |
| -1.185000000000081 | -0.315 | -0.115 | -0.056 |
| -1.180000000000081 | -0.312 | -0.114 | -0.056 |
| -1.175000000000082 | -0.309 | -0.113 | -0.055 |
| -1.170000000000082 | -0.306 | -0.111 | -0.054 |
| -1.165000000000082 | -0.304 | -0.11 | -0.054 |
| -1.160000000000082 | -0.301 | -0.109 | -0.053 |
| -1.155000000000082 | -0.298 | -0.108 | -0.052 |
| -1.150000000000082 | -0.295 | -0.106 | -0.052 |
| -1.145000000000082 | -0.292 | -0.105 | -0.051 |
| -1.140000000000082 | -0.289 | -0.104 | -0.051 |
| -1.135000000000082 | -0.286 | -0.103 | -0.05 |
| -1.130000000000082 | -0.284 | -0.101 | -0.049 |
| -1.125000000000083 | -0.281 | -0.1 | -0.049 |
| -1.120000000000083 | -0.278 | -0.099 | -0.048 |
| -1.115000000000083 | -0.275 | -0.098 | -0.047 |
| -1.110000000000083 | -0.273 | -0.097 | -0.047 |
| -1.105000000000083 | -0.27 | -0.095 | -0.046 |
| -1.100000000000083 | -0.267 | -0.094 | -0.046 |
| -1.095000000000083 | -0.264 | -0.093 | -0.045 |
| -1.090000000000083 | -0.262 | -0.092 | -0.044 |
| -1.085000000000083 | -0.259 | -0.091 | -0.044 |
| -1.080000000000084 | -0.256 | -0.09 | -0.043 |
| -1.075000000000084 | -0.253 | -0.089 | -0.043 |
| -1.070000000000084 | -0.251 | -0.087 | -0.042 |
| -1.065000000000084 | -0.248 | -0.086 | -0.042 |
| -1.060000000000084 | -0.245 | -0.085 | -0.041 |
| -1.055000000000084 | -0.243 | -0.084 | -0.041 |
| -1.050000000000084 | -0.24 | -0.083 | -0.04 |
| -1.045000000000084 | -0.238 | -0.082 | -0.039 |
| -1.040000000000084 | -0.235 | -0.081 | -0.039 |
| -1.035000000000085 | -0.232 | -0.08 | -0.038 |
| -1.030000000000085 | -0.23 | -0.079 | -0.038 |
| -1.025000000000085 | -0.227 | -0.078 | -0.037 |
| -1.020000000000085 | -0.225 | -0.077 | -0.037 |
| -1.015000000000085 | -0.222 | -0.076 | -0.036 |
| -1.010000000000085 | -0.22 | -0.075 | -0.036 |
| -1.005000000000085 | -0.217 | -0.074 | -0.035 |
| -1.000000000000085 | -0.215 | -0.073 | -0.035 |
| -0.995000000000085 | -0.212 | -0.072 | -0.034 |
| -0.990000000000085 | -0.21 | -0.071 | -0.034 |
| -0.985000000000085 | -0.207 | -0.07 | -0.033 |
| -0.980000000000085 | -0.205 | -0.069 | -0.033 |
| -0.975000000000085 | -0.202 | -0.068 | -0.032 |
| -0.970000000000085 | -0.2 | -0.067 | -0.032 |
| -0.965000000000085 | -0.197 | -0.066 | -0.031 |
| -0.960000000000085 | -0.195 | -0.065 | -0.031 |
| -0.955000000000085 | -0.193 | -0.064 | -0.03 |
| -0.950000000000085 | -0.19 | -0.063 | -0.03 |
| -0.945000000000085 | -0.188 | -0.062 | -0.03 |
| -0.940000000000085 | -0.186 | -0.061 | -0.029 |
| -0.935000000000085 | -0.183 | -0.06 | -0.029 |
| -0.930000000000085 | -0.181 | -0.059 | -0.028 |
| -0.925000000000085 | -0.179 | -0.059 | -0.028 |
| -0.920000000000085 | -0.176 | -0.058 | -0.027 |
| -0.915000000000085 | -0.174 | -0.057 | -0.027 |
| -0.910000000000085 | -0.172 | -0.056 | -0.026 |
| -0.905000000000085 | -0.169 | -0.055 | -0.026 |
| -0.900000000000085 | -0.167 | -0.054 | -0.026 |
| -0.895000000000085 | -0.165 | -0.053 | -0.025 |
| -0.890000000000085 | -0.163 | -0.053 | -0.025 |
| -0.885000000000085 | -0.161 | -0.052 | -0.024 |
| -0.880000000000085 | -0.158 | -0.051 | -0.024 |
| -0.875000000000085 | -0.156 | -0.05 | -0.024 |
| -0.870000000000085 | -0.154 | -0.049 | -0.023 |
| -0.865000000000085 | -0.152 | -0.049 | -0.023 |
| -0.860000000000085 | -0.15 | -0.048 | -0.022 |
| -0.855000000000085 | -0.148 | -0.047 | -0.022 |
| -0.850000000000085 | -0.146 | -0.046 | -0.022 |
| -0.845000000000085 | -0.143 | -0.045 | -0.021 |
| -0.840000000000085 | -0.141 | -0.045 | -0.021 |
| -0.835000000000085 | -0.139 | -0.044 | -0.021 |
| -0.830000000000085 | -0.137 | -0.043 | -0.02 |
| -0.825000000000085 | -0.135 | -0.043 | -0.02 |
| -0.820000000000085 | -0.133 | -0.042 | -0.02 |
| -0.815000000000085 | -0.131 | -0.041 | -0.019 |
| -0.810000000000085 | -0.129 | -0.04 | -0.019 |
| -0.805000000000085 | -0.127 | -0.04 | -0.019 |
| -0.800000000000085 | -0.125 | -0.039 | -0.018 |
| -0.795000000000085 | -0.123 | -0.038 | -0.018 |
| -0.790000000000085 | -0.121 | -0.038 | -0.018 |
| -0.785000000000085 | -0.119 | -0.037 | -0.017 |
| -0.780000000000085 | -0.118 | -0.036 | -0.017 |
| -0.775000000000085 | -0.116 | -0.036 | -0.017 |
| -0.770000000000085 | -0.114 | -0.035 | -0.016 |
| -0.765000000000085 | -0.112 | -0.034 | -0.016 |
| -0.760000000000085 | -0.11 | -0.034 | -0.016 |
| -0.755000000000085 | -0.108 | -0.033 | -0.015 |
| -0.750000000000085 | -0.106 | -0.032 | -0.015 |
| -0.745000000000085 | -0.105 | -0.032 | -0.015 |
| -0.740000000000085 | -0.103 | -0.031 | -0.014 |
| -0.735000000000085 | -0.101 | -0.031 | -0.014 |
| -0.730000000000085 | -0.099 | -0.03 | -0.014 |
| -0.725000000000085 | -0.098 | -0.029 | -0.014 |
| -0.720000000000085 | -0.096 | -0.029 | -0.013 |
| -0.715000000000085 | -0.094 | -0.028 | -0.013 |
| -0.710000000000085 | -0.093 | -0.028 | -0.013 |
| -0.705000000000085 | -0.091 | -0.027 | -0.013 |
| -0.700000000000085 | -0.089 | -0.027 | -0.012 |
| -0.695000000000085 | -0.088 | -0.026 | -0.012 |
| -0.690000000000085 | -0.086 | -0.026 | -0.012 |
| -0.685000000000085 | -0.084 | -0.025 | -0.012 |
| -0.680000000000085 | -0.083 | -0.025 | -0.011 |
| -0.675000000000085 | -0.081 | -0.024 | -0.011 |
| -0.670000000000085 | -0.08 | -0.024 | -0.011 |
| -0.665000000000085 | -0.078 | -0.023 | -0.011 |
| -0.660000000000085 | -0.077 | -0.023 | -0.01 |
| -0.655000000000085 | -0.075 | -0.022 | -0.01 |
| -0.650000000000085 | -0.074 | -0.022 | -0.01 |
| -0.645000000000085 | -0.072 | -0.021 | -0.01 |
| -0.640000000000085 | -0.071 | -0.021 | -0.009 |
| -0.635000000000085 | -0.069 | -0.02 | -0.009 |
| -0.630000000000085 | -0.068 | -0.02 | -0.009 |
| -0.625000000000085 | -0.066 | -0.019 | -0.009 |
| -0.620000000000085 | -0.065 | -0.019 | -0.009 |
| -0.615000000000085 | -0.064 | -0.018 | -0.008 |
| -0.610000000000085 | -0.062 | -0.018 | -0.008 |
| -0.605000000000085 | -0.061 | -0.018 | -0.008 |
| -0.600000000000085 | -0.06 | -0.017 | -0.008 |
| -0.595000000000085 | -0.058 | -0.017 | -0.008 |
| -0.590000000000085 | -0.057 | -0.016 | -0.007 |
| -0.585000000000085 | -0.056 | -0.016 | -0.007 |
| -0.580000000000085 | -0.054 | -0.015 | -0.007 |
| -0.575000000000085 | -0.053 | -0.015 | -0.007 |
| -0.570000000000085 | -0.052 | -0.015 | -0.007 |
| -0.565000000000085 | -0.051 | -0.014 | -0.007 |
| -0.560000000000085 | -0.05 | -0.014 | -0.006 |
| -0.555000000000085 | -0.048 | -0.014 | -0.006 |
| -0.550000000000085 | -0.047 | -0.013 | -0.006 |
| -0.545000000000085 | -0.046 | -0.013 | -0.006 |
| -0.540000000000085 | -0.045 | -0.013 | -0.006 |
| -0.535000000000085 | -0.044 | -0.012 | -0.006 |
| -0.530000000000085 | -0.043 | -0.012 | -0.005 |
| -0.525000000000085 | -0.042 | -0.012 | -0.005 |
| -0.520000000000085 | -0.04 | -0.011 | -0.005 |
| -0.515000000000085 | -0.039 | -0.011 | -0.005 |
| -0.510000000000085 | -0.038 | -0.011 | -0.005 |
| -0.505000000000085 | -0.037 | -0.01 | -0.005 |
| -0.500000000000085 | -0.036 | -0.01 | -0.005 |
| -0.495000000000085 | -0.035 | -0.01 | -0.004 |
| -0.490000000000085 | -0.034 | -0.009 | -0.004 |
| -0.485000000000085 | -0.033 | -0.009 | -0.004 |
| -0.480000000000085 | -0.032 | -0.009 | -0.004 |
| -0.475000000000085 | -0.032 | -0.009 | -0.004 |
| -0.470000000000085 | -0.031 | -0.008 | -0.004 |
| -0.465000000000085 | -0.03 | -0.008 | -0.004 |
| -0.460000000000085 | -0.029 | -0.008 | -0.004 |
| -0.455000000000085 | -0.028 | -0.008 | -0.003 |
| -0.450000000000085 | -0.027 | -0.007 | -0.003 |
| -0.445000000000085 | -0.026 | -0.007 | -0.003 |
| -0.440000000000085 | -0.025 | -0.007 | -0.003 |
| -0.435000000000085 | -0.025 | -0.007 | -0.003 |
| -0.430000000000085 | -0.024 | -0.006 | -0.003 |
| -0.425000000000085 | -0.023 | -0.006 | -0.003 |
| -0.420000000000085 | -0.022 | -0.006 | -0.003 |
| -0.415000000000085 | -0.022 | -0.006 | -0.003 |
| -0.410000000000085 | -0.021 | -0.006 | -0.003 |
| -0.405000000000085 | -0.02 | -0.005 | -0.002 |
| -0.400000000000085 | -0.019 | -0.005 | -0.002 |
| -0.395000000000085 | -0.019 | -0.005 | -0.002 |
| -0.390000000000085 | -0.018 | -0.005 | -0.002 |
| -0.385000000000085 | -0.017 | -0.005 | -0.002 |
| -0.380000000000085 | -0.017 | -0.004 | -0.002 |
| -0.375000000000085 | -0.016 | -0.004 | -0.002 |
| -0.370000000000085 | -0.016 | -0.004 | -0.002 |
| -0.365000000000085 | -0.015 | -0.004 | -0.002 |
| -0.360000000000085 | -0.014 | -0.004 | -0.002 |
| -0.355000000000085 | -0.014 | -0.004 | -0.002 |
| -0.350000000000085 | -0.013 | -0.004 | -0.002 |
| -0.345000000000085 | -0.013 | -0.003 | -0.002 |
| -0.340000000000085 | -0.012 | -0.003 | -0.001 |
| -0.335000000000085 | -0.012 | -0.003 | -0.001 |
| -0.330000000000085 | -0.011 | -0.003 | -0.001 |
| -0.325000000000085 | -0.011 | -0.003 | -0.001 |
| -0.320000000000085 | -0.01 | -0.003 | -0.001 |
| -0.315000000000085 | -0.01 | -0.003 | -0.001 |
| -0.310000000000085 | -0.009 | -0.002 | -0.001 |
| -0.305000000000085 | -0.009 | -0.002 | -0.001 |
| -0.300000000000085 | -0.009 | -0.002 | -0.001 |
| -0.295000000000085 | -0.008 | -0.002 | -0.001 |
| -0.290000000000085 | -0.008 | -0.002 | -0.001 |
| -0.285000000000085 | -0.007 | -0.002 | -0.001 |
| -0.280000000000085 | -0.007 | -0.002 | -0.001 |
| -0.275000000000085 | -0.007 | -0.002 | -0.001 |
| -0.270000000000085 | -0.006 | -0.002 | -0.001 |
| -0.265000000000085 | -0.006 | -0.002 | -0.001 |
| -0.260000000000085 | -0.006 | -0.001 | -0.001 |
| -0.255000000000085 | -0.005 | -0.001 | -0.001 |
| -0.250000000000085 | -0.005 | -0.001 | -0.001 |
| -0.245000000000085 | -0.005 | -0.001 | -0.001 |
| -0.240000000000085 | -0.004 | -0.001 | -0.001 |
| -0.235000000000085 | -0.004 | -0.001 | 0 |
| -0.230000000000085 | -0.004 | -0.001 | 0 |
| -0.225000000000085 | -0.004 | -0.001 | 0 |
| -0.220000000000085 | -0.003 | -0.001 | 0 |
| -0.215000000000085 | -0.003 | -0.001 | 0 |
| -0.210000000000085 | -0.003 | -0.001 | 0 |
| -0.205000000000085 | -0.003 | -0.001 | 0 |
| -0.200000000000085 | -0.003 | -0.001 | 0 |
| -0.195000000000085 | -0.002 | -0.001 | 0 |
| -0.190000000000085 | -0.002 | -0.001 | 0 |
| -0.185000000000085 | -0.002 | -0.001 | 0 |
| -0.180000000000085 | -0.002 | 0 | 0 |
| -0.175000000000085 | -0.002 | 0 | 0 |
| -0.170000000000085 | -0.002 | 0 | 0 |
| -0.165000000000085 | -0.001 | 0 | 0 |
| -0.160000000000085 | -0.001 | 0 | 0 |
| -0.155000000000084 | -0.001 | 0 | 0 |
| -0.150000000000084 | -0.001 | 0 | 0 |
| -0.145000000000084 | -0.001 | 0 | 0 |
| -0.140000000000084 | -0.001 | 0 | 0 |
| -0.135000000000084 | -0.001 | 0 | 0 |
| -0.130000000000084 | -0.001 | 0 | 0 |
| -0.125000000000084 | -0.001 | 0 | 0 |
| -0.120000000000084 | -0.001 | 0 | 0 |
| -0.115000000000084 | -0.001 | 0 | 0 |
| -0.110000000000084 | 0 | 0 | 0 |
| -0.105000000000084 | 0 | 0 | 0 |
| -0.100000000000084 | 0 | 0 | 0 |
| -0.0950000000000844 | 0 | 0 | 0 |
| -0.0900000000000844 | 0 | 0 | 0 |
| -0.0850000000000844 | 0 | 0 | 0 |
| -0.0800000000000844 | 0 | 0 | 0 |
| -0.0750000000000844 | 0 | 0 | 0 |
| -0.0700000000000844 | 0 | 0 | 0 |
| -0.0650000000000844 | 0 | 0 | 0 |
| -0.0600000000000844 | 0 | 0 | 0 |
| -0.0550000000000844 | 0 | 0 | 0 |
| -0.0500000000000844 | 0 | 0 | 0 |
| -0.0450000000000844 | 0 | 0 | 0 |
| -0.0400000000000844 | 0 | 0 | 0 |
| -0.0350000000000844 | 0 | 0 | 0 |
| -0.0300000000000844 | 0 | 0 | 0 |
| -0.0250000000000844 | 0 | 0 | 0 |
| -0.0200000000000844 | 0 | 0 | 0 |
| -0.0150000000000844 | 0 | 0 | 0 |
| -0.0100000000000844 | 0 | 0 | 0 |
| -0.00500000000008444 | 0 | 0 | 0 |
| -8.4444604087075e-14 | 0 | 0 | 0 |
| 0.00499999999991555 | 0 | 0 | 0 |
| 0.00999999999991555 | 0 | 0 | 0 |
| 0.0149999999999156 | 0 | 0 | 0 |
| 0.0199999999999156 | 0 | 0 | 0 |
| 0.0249999999999156 | 0 | 0 | 0 |
| 0.0299999999999156 | 0 | 0 | 0 |
| 0.0349999999999155 | 0 | 0 | 0 |
| 0.0399999999999155 | 0 | 0 | 0 |
| 0.0449999999999155 | 0 | 0 | 0 |
| 0.0499999999999155 | 0 | 0 | 0 |
| 0.0549999999999155 | 0 | 0 | 0 |
| 0.0599999999999155 | 0 | 0 | 0 |
| 0.0649999999999155 | 0 | 0 | 0 |
| 0.0699999999999155 | 0 | 0 | 0 |
| 0.0749999999999155 | 0 | 0 | 0 |
| 0.0799999999999155 | 0 | 0 | 0 |
| 0.0849999999999155 | 0 | 0 | 0 |
| 0.0899999999999155 | 0 | 0 | 0 |
| 0.0949999999999155 | 0 | 0 | 0 |
| 0.0999999999999155 | 0 | 0 | 0 |
| 0.104999999999916 | 0 | 0 | 0 |
| 0.109999999999916 | 0 | 0 | 0 |
| 0.114999999999916 | 0.001 | 0 | 0 |
| 0.119999999999916 | 0.001 | 0 | 0 |
| 0.124999999999916 | 0.001 | 0 | 0 |
| 0.129999999999916 | 0.001 | 0 | 0 |
| 0.134999999999916 | 0.001 | 0 | 0 |
| 0.139999999999916 | 0.001 | 0 | 0 |
| 0.144999999999916 | 0.001 | 0 | 0 |
| 0.149999999999916 | 0.001 | 0 | 0 |
| 0.154999999999916 | 0.001 | 0 | 0 |
| 0.159999999999916 | 0.001 | 0 | 0 |
| 0.164999999999916 | 0.001 | 0 | 0 |
| 0.169999999999916 | 0.002 | 0 | 0 |
| 0.174999999999916 | 0.002 | 0 | 0 |
| 0.179999999999916 | 0.002 | 0 | 0 |
| 0.184999999999916 | 0.002 | 0.001 | 0 |
| 0.189999999999916 | 0.002 | 0.001 | 0 |
| 0.194999999999916 | 0.002 | 0.001 | 0 |
| 0.199999999999916 | 0.003 | 0.001 | 0 |
| 0.204999999999916 | 0.003 | 0.001 | 0 |
| 0.209999999999916 | 0.003 | 0.001 | 0 |
| 0.214999999999916 | 0.003 | 0.001 | 0 |
| 0.219999999999916 | 0.003 | 0.001 | 0 |
| 0.224999999999916 | 0.004 | 0.001 | 0 |
| 0.229999999999916 | 0.004 | 0.001 | 0 |
| 0.234999999999916 | 0.004 | 0.001 | 0 |
| 0.239999999999916 | 0.004 | 0.001 | 0.001 |
| 0.244999999999916 | 0.005 | 0.001 | 0.001 |
| 0.249999999999916 | 0.005 | 0.001 | 0.001 |
| 0.254999999999916 | 0.005 | 0.001 | 0.001 |
| 0.259999999999916 | 0.006 | 0.001 | 0.001 |
| 0.264999999999916 | 0.006 | 0.002 | 0.001 |
| 0.269999999999916 | 0.006 | 0.002 | 0.001 |
| 0.274999999999916 | 0.007 | 0.002 | 0.001 |
| 0.279999999999916 | 0.007 | 0.002 | 0.001 |
| 0.284999999999916 | 0.007 | 0.002 | 0.001 |
| 0.289999999999916 | 0.008 | 0.002 | 0.001 |
| 0.294999999999916 | 0.008 | 0.002 | 0.001 |
| 0.299999999999916 | 0.009 | 0.002 | 0.001 |
| 0.304999999999916 | 0.009 | 0.002 | 0.001 |
| 0.309999999999916 | 0.009 | 0.002 | 0.001 |
| 0.314999999999916 | 0.01 | 0.003 | 0.001 |
| 0.319999999999916 | 0.01 | 0.003 | 0.001 |
| 0.324999999999916 | 0.011 | 0.003 | 0.001 |
| 0.329999999999916 | 0.011 | 0.003 | 0.001 |
| 0.334999999999916 | 0.012 | 0.003 | 0.001 |
| 0.339999999999916 | 0.012 | 0.003 | 0.001 |
| 0.344999999999916 | 0.013 | 0.003 | 0.002 |
| 0.349999999999916 | 0.013 | 0.004 | 0.002 |
| 0.354999999999916 | 0.014 | 0.004 | 0.002 |
| 0.359999999999916 | 0.014 | 0.004 | 0.002 |
| 0.364999999999916 | 0.015 | 0.004 | 0.002 |
| 0.369999999999916 | 0.016 | 0.004 | 0.002 |
| 0.374999999999916 | 0.016 | 0.004 | 0.002 |
| 0.379999999999916 | 0.017 | 0.004 | 0.002 |
| 0.384999999999916 | 0.017 | 0.005 | 0.002 |
| 0.389999999999916 | 0.018 | 0.005 | 0.002 |
| 0.394999999999916 | 0.019 | 0.005 | 0.002 |
| 0.399999999999916 | 0.019 | 0.005 | 0.002 |
| 0.404999999999916 | 0.02 | 0.005 | 0.002 |
| 0.409999999999916 | 0.021 | 0.006 | 0.003 |
| 0.414999999999916 | 0.022 | 0.006 | 0.003 |
| 0.419999999999916 | 0.022 | 0.006 | 0.003 |
| 0.424999999999916 | 0.023 | 0.006 | 0.003 |
| 0.429999999999916 | 0.024 | 0.006 | 0.003 |
| 0.434999999999916 | 0.025 | 0.007 | 0.003 |
| 0.439999999999916 | 0.025 | 0.007 | 0.003 |
| 0.444999999999916 | 0.026 | 0.007 | 0.003 |
| 0.449999999999916 | 0.027 | 0.007 | 0.003 |
| 0.454999999999916 | 0.028 | 0.008 | 0.003 |
| 0.459999999999916 | 0.029 | 0.008 | 0.004 |
| 0.464999999999916 | 0.03 | 0.008 | 0.004 |
| 0.469999999999916 | 0.031 | 0.008 | 0.004 |
| 0.474999999999916 | 0.032 | 0.009 | 0.004 |
| 0.479999999999916 | 0.032 | 0.009 | 0.004 |
| 0.484999999999916 | 0.033 | 0.009 | 0.004 |
| 0.489999999999916 | 0.034 | 0.009 | 0.004 |
| 0.494999999999916 | 0.035 | 0.01 | 0.004 |
| 0.499999999999916 | 0.036 | 0.01 | 0.005 |
| 0.504999999999916 | 0.037 | 0.01 | 0.005 |
| 0.509999999999916 | 0.038 | 0.011 | 0.005 |
| 0.514999999999916 | 0.039 | 0.011 | 0.005 |
| 0.519999999999916 | 0.04 | 0.011 | 0.005 |
| 0.524999999999916 | 0.042 | 0.012 | 0.005 |
| 0.529999999999916 | 0.043 | 0.012 | 0.005 |
| 0.534999999999916 | 0.044 | 0.012 | 0.006 |
| 0.539999999999916 | 0.045 | 0.013 | 0.006 |
| 0.544999999999916 | 0.046 | 0.013 | 0.006 |
| 0.549999999999916 | 0.047 | 0.013 | 0.006 |
| 0.554999999999916 | 0.048 | 0.014 | 0.006 |
| 0.559999999999916 | 0.05 | 0.014 | 0.006 |
| 0.564999999999916 | 0.051 | 0.014 | 0.007 |
| 0.569999999999916 | 0.052 | 0.015 | 0.007 |
| 0.574999999999916 | 0.053 | 0.015 | 0.007 |
| 0.579999999999916 | 0.054 | 0.015 | 0.007 |
| 0.584999999999916 | 0.056 | 0.016 | 0.007 |
| 0.589999999999916 | 0.057 | 0.016 | 0.007 |
| 0.594999999999916 | 0.058 | 0.017 | 0.008 |
| 0.599999999999916 | 0.06 | 0.017 | 0.008 |
| 0.604999999999916 | 0.061 | 0.018 | 0.008 |
| 0.609999999999916 | 0.062 | 0.018 | 0.008 |
| 0.614999999999916 | 0.064 | 0.018 | 0.008 |
| 0.619999999999916 | 0.065 | 0.019 | 0.009 |
| 0.624999999999916 | 0.066 | 0.019 | 0.009 |
| 0.629999999999916 | 0.068 | 0.02 | 0.009 |
| 0.634999999999916 | 0.069 | 0.02 | 0.009 |
| 0.639999999999916 | 0.071 | 0.021 | 0.009 |
| 0.644999999999916 | 0.072 | 0.021 | 0.01 |
| 0.649999999999916 | 0.074 | 0.022 | 0.01 |
| 0.654999999999916 | 0.075 | 0.022 | 0.01 |
| 0.659999999999916 | 0.077 | 0.023 | 0.01 |
| 0.664999999999916 | 0.078 | 0.023 | 0.011 |
| 0.669999999999916 | 0.08 | 0.024 | 0.011 |
| 0.674999999999916 | 0.081 | 0.024 | 0.011 |
| 0.679999999999916 | 0.083 | 0.025 | 0.011 |
| 0.684999999999916 | 0.084 | 0.025 | 0.012 |
| 0.689999999999916 | 0.086 | 0.026 | 0.012 |
| 0.694999999999916 | 0.088 | 0.026 | 0.012 |
| 0.699999999999916 | 0.089 | 0.027 | 0.012 |
| 0.704999999999916 | 0.091 | 0.027 | 0.013 |
| 0.709999999999916 | 0.093 | 0.028 | 0.013 |
| 0.714999999999916 | 0.094 | 0.028 | 0.013 |
| 0.719999999999916 | 0.096 | 0.029 | 0.013 |
| 0.724999999999916 | 0.098 | 0.029 | 0.014 |
| 0.729999999999916 | 0.099 | 0.03 | 0.014 |
| 0.734999999999916 | 0.101 | 0.031 | 0.014 |
| 0.739999999999916 | 0.103 | 0.031 | 0.014 |
| 0.744999999999916 | 0.105 | 0.032 | 0.015 |
| 0.749999999999916 | 0.106 | 0.032 | 0.015 |
| 0.754999999999916 | 0.108 | 0.033 | 0.015 |
| 0.759999999999916 | 0.11 | 0.034 | 0.016 |
| 0.764999999999916 | 0.112 | 0.034 | 0.016 |
| 0.769999999999916 | 0.114 | 0.035 | 0.016 |
| 0.774999999999916 | 0.116 | 0.036 | 0.017 |
| 0.779999999999916 | 0.118 | 0.036 | 0.017 |
| 0.784999999999916 | 0.119 | 0.037 | 0.017 |
| 0.789999999999916 | 0.121 | 0.038 | 0.018 |
| 0.794999999999916 | 0.123 | 0.038 | 0.018 |
| 0.799999999999916 | 0.125 | 0.039 | 0.018 |
| 0.804999999999916 | 0.127 | 0.04 | 0.019 |
| 0.809999999999916 | 0.129 | 0.04 | 0.019 |
| 0.814999999999916 | 0.131 | 0.041 | 0.019 |
| 0.819999999999916 | 0.133 | 0.042 | 0.02 |
| 0.824999999999916 | 0.135 | 0.043 | 0.02 |
| 0.829999999999916 | 0.137 | 0.043 | 0.02 |
| 0.834999999999916 | 0.139 | 0.044 | 0.021 |
| 0.839999999999916 | 0.141 | 0.045 | 0.021 |
| 0.844999999999916 | 0.143 | 0.045 | 0.021 |
| 0.849999999999916 | 0.146 | 0.046 | 0.022 |
| 0.854999999999916 | 0.148 | 0.047 | 0.022 |
| 0.859999999999916 | 0.15 | 0.048 | 0.022 |
| 0.864999999999916 | 0.152 | 0.049 | 0.023 |
| 0.869999999999916 | 0.154 | 0.049 | 0.023 |
| 0.874999999999916 | 0.156 | 0.05 | 0.024 |
| 0.879999999999916 | 0.158 | 0.051 | 0.024 |
| 0.884999999999916 | 0.161 | 0.052 | 0.024 |
| 0.889999999999916 | 0.163 | 0.053 | 0.025 |
| 0.894999999999916 | 0.165 | 0.053 | 0.025 |
| 0.899999999999916 | 0.167 | 0.054 | 0.026 |
| 0.904999999999916 | 0.169 | 0.055 | 0.026 |
| 0.909999999999916 | 0.172 | 0.056 | 0.026 |
| 0.914999999999916 | 0.174 | 0.057 | 0.027 |
| 0.919999999999916 | 0.176 | 0.058 | 0.027 |
| 0.924999999999916 | 0.179 | 0.059 | 0.028 |
| 0.929999999999916 | 0.181 | 0.059 | 0.028 |
| 0.934999999999916 | 0.183 | 0.06 | 0.029 |
| 0.939999999999916 | 0.186 | 0.061 | 0.029 |
| 0.944999999999916 | 0.188 | 0.062 | 0.03 |
| 0.949999999999916 | 0.19 | 0.063 | 0.03 |
| 0.954999999999916 | 0.193 | 0.064 | 0.03 |
| 0.959999999999916 | 0.195 | 0.065 | 0.031 |
| 0.964999999999916 | 0.197 | 0.066 | 0.031 |
| 0.969999999999916 | 0.2 | 0.067 | 0.032 |
| 0.974999999999916 | 0.202 | 0.068 | 0.032 |
| 0.979999999999916 | 0.205 | 0.069 | 0.033 |
| 0.984999999999916 | 0.207 | 0.07 | 0.033 |
| 0.989999999999916 | 0.21 | 0.071 | 0.034 |
| 0.994999999999916 | 0.212 | 0.072 | 0.034 |
| 0.999999999999916 | 0.215 | 0.073 | 0.035 |
| 1.004999999999916 | 0.217 | 0.074 | 0.035 |
| 1.009999999999916 | 0.22 | 0.075 | 0.036 |
| 1.014999999999916 | 0.222 | 0.076 | 0.036 |
| 1.019999999999916 | 0.225 | 0.077 | 0.037 |
| 1.024999999999916 | 0.227 | 0.078 | 0.037 |
| 1.029999999999916 | 0.23 | 0.079 | 0.038 |
| 1.034999999999916 | 0.232 | 0.08 | 0.038 |
| 1.039999999999915 | 0.235 | 0.081 | 0.039 |
| 1.044999999999915 | 0.238 | 0.082 | 0.039 |
| 1.049999999999915 | 0.24 | 0.083 | 0.04 |
| 1.054999999999915 | 0.243 | 0.084 | 0.041 |
| 1.059999999999915 | 0.245 | 0.085 | 0.041 |
| 1.064999999999915 | 0.248 | 0.086 | 0.042 |
| 1.069999999999915 | 0.251 | 0.087 | 0.042 |
| 1.074999999999915 | 0.253 | 0.089 | 0.043 |
| 1.079999999999915 | 0.256 | 0.09 | 0.043 |
| 1.084999999999914 | 0.259 | 0.091 | 0.044 |
| 1.089999999999914 | 0.262 | 0.092 | 0.044 |
| 1.094999999999914 | 0.264 | 0.093 | 0.045 |
| 1.099999999999914 | 0.267 | 0.094 | 0.046 |
| 1.104999999999914 | 0.27 | 0.095 | 0.046 |
| 1.109999999999914 | 0.273 | 0.097 | 0.047 |
| 1.114999999999914 | 0.275 | 0.098 | 0.047 |
| 1.119999999999914 | 0.278 | 0.099 | 0.048 |
| 1.124999999999914 | 0.281 | 0.1 | 0.049 |
| 1.129999999999914 | 0.284 | 0.101 | 0.049 |
| 1.134999999999913 | 0.286 | 0.103 | 0.05 |
| 1.139999999999913 | 0.289 | 0.104 | 0.051 |
| 1.144999999999913 | 0.292 | 0.105 | 0.051 |
| 1.149999999999913 | 0.295 | 0.106 | 0.052 |
| 1.154999999999913 | 0.298 | 0.108 | 0.052 |
| 1.159999999999913 | 0.301 | 0.109 | 0.053 |
| 1.164999999999913 | 0.304 | 0.11 | 0.054 |
| 1.169999999999913 | 0.306 | 0.111 | 0.054 |
| 1.174999999999913 | 0.309 | 0.113 | 0.055 |
| 1.179999999999912 | 0.312 | 0.114 | 0.056 |
| 1.184999999999912 | 0.315 | 0.115 | 0.056 |
| 1.189999999999912 | 0.318 | 0.117 | 0.057 |
| 1.194999999999912 | 0.321 | 0.118 | 0.058 |
| 1.199999999999912 | 0.324 | 0.119 | 0.058 |
| 1.204999999999912 | 0.327 | 0.12 | 0.059 |
| 1.209999999999912 | 0.33 | 0.122 | 0.06 |
| 1.214999999999912 | 0.333 | 0.123 | 0.061 |
| 1.219999999999912 | 0.336 | 0.125 | 0.061 |
| 1.224999999999911 | 0.339 | 0.126 | 0.062 |
| 1.229999999999911 | 0.342 | 0.127 | 0.063 |
| 1.234999999999911 | 0.345 | 0.129 | 0.063 |
| 1.239999999999911 | 0.348 | 0.13 | 0.064 |
| 1.244999999999911 | 0.351 | 0.131 | 0.065 |
| 1.249999999999911 | 0.354 | 0.133 | 0.066 |
| 1.254999999999911 | 0.357 | 0.134 | 0.066 |
| 1.259999999999911 | 0.36 | 0.136 | 0.067 |
| 1.264999999999911 | 0.363 | 0.137 | 0.068 |
| 1.269999999999911 | 0.366 | 0.138 | 0.069 |
| 1.27499999999991 | 0.369 | 0.14 | 0.069 |
| 1.27999999999991 | 0.372 | 0.141 | 0.07 |
| 1.28499999999991 | 0.376 | 0.143 | 0.071 |
| 1.28999999999991 | 0.379 | 0.144 | 0.072 |
| 1.29499999999991 | 0.382 | 0.146 | 0.072 |
| 1.29999999999991 | 0.385 | 0.147 | 0.073 |
| 1.30499999999991 | 0.388 | 0.149 | 0.074 |
| 1.30999999999991 | 0.391 | 0.15 | 0.075 |
| 1.31499999999991 | 0.394 | 0.152 | 0.076 |
| 1.319999999999909 | 0.398 | 0.153 | 0.076 |
| 1.324999999999909 | 0.401 | 0.155 | 0.077 |
| 1.329999999999909 | 0.404 | 0.156 | 0.078 |
| 1.334999999999909 | 0.407 | 0.158 | 0.079 |
| 1.339999999999909 | 0.41 | 0.159 | 0.08 |
| 1.344999999999909 | 0.414 | 0.161 | 0.081 |
| 1.349999999999909 | 0.417 | 0.163 | 0.081 |
| 1.354999999999909 | 0.42 | 0.164 | 0.082 |
| 1.359999999999909 | 0.423 | 0.166 | 0.083 |
| 1.364999999999908 | 0.426 | 0.167 | 0.084 |
| 1.369999999999908 | 0.43 | 0.169 | 0.085 |
| 1.374999999999908 | 0.433 | 0.17 | 0.086 |
| 1.379999999999908 | 0.436 | 0.172 | 0.087 |
| 1.384999999999908 | 0.44 | 0.174 | 0.087 |
| 1.389999999999908 | 0.443 | 0.175 | 0.088 |
| 1.394999999999908 | 0.446 | 0.177 | 0.089 |
| 1.399999999999908 | 0.449 | 0.179 | 0.09 |
| 1.404999999999908 | 0.453 | 0.18 | 0.091 |
| 1.409999999999908 | 0.456 | 0.182 | 0.092 |
| 1.414999999999907 | 0.459 | 0.184 | 0.093 |
| 1.419999999999907 | 0.463 | 0.185 | 0.094 |
| 1.424999999999907 | 0.466 | 0.187 | 0.095 |
| 1.429999999999907 | 0.469 | 0.189 | 0.096 |
| 1.434999999999907 | 0.473 | 0.19 | 0.097 |
| 1.439999999999907 | 0.476 | 0.192 | 0.097 |
| 1.444999999999907 | 0.48 | 0.194 | 0.098 |
| 1.449999999999907 | 0.483 | 0.195 | 0.099 |
| 1.454999999999907 | 0.486 | 0.197 | 0.1 |
| 1.459999999999906 | 0.49 | 0.199 | 0.101 |
| 1.464999999999906 | 0.493 | 0.201 | 0.102 |
| 1.469999999999906 | 0.497 | 0.202 | 0.103 |
| 1.474999999999906 | 0.5 | 0.204 | 0.104 |
| 1.479999999999906 | 0.503 | 0.206 | 0.105 |
| 1.484999999999906 | 0.507 | 0.208 | 0.106 |
| 1.489999999999906 | 0.51 | 0.209 | 0.107 |
| 1.494999999999906 | 0.514 | 0.211 | 0.108 |
| 1.499999999999906 | 0.517 | 0.213 | 0.109 |
| 1.504999999999906 | 0.521 | 0.215 | 0.11 |
| 1.509999999999905 | 0.524 | 0.217 | 0.111 |
| 1.514999999999905 | 0.528 | 0.218 | 0.112 |
| 1.519999999999905 | 0.531 | 0.22 | 0.113 |
| 1.524999999999905 | 0.535 | 0.222 | 0.114 |
| 1.529999999999905 | 0.538 | 0.224 | 0.115 |
| 1.534999999999905 | 0.542 | 0.226 | 0.116 |
| 1.539999999999905 | 0.545 | 0.228 | 0.117 |
| 1.544999999999905 | 0.549 | 0.23 | 0.118 |
| 1.549999999999905 | 0.552 | 0.231 | 0.119 |
| 1.554999999999904 | 0.556 | 0.233 | 0.12 |
| 1.559999999999904 | 0.559 | 0.235 | 0.121 |
| 1.564999999999904 | 0.563 | 0.237 | 0.123 |
| 1.569999999999904 | 0.566 | 0.239 | 0.124 |
| 1.574999999999904 | 0.57 | 0.241 | 0.125 |
| 1.579999999999904 | 0.573 | 0.243 | 0.126 |
| 1.584999999999904 | 0.577 | 0.245 | 0.127 |
| 1.589999999999904 | 0.581 | 0.247 | 0.128 |
| 1.594999999999904 | 0.584 | 0.249 | 0.129 |
| 1.599999999999903 | 0.588 | 0.251 | 0.13 |
| 1.604999999999903 | 0.591 | 0.252 | 0.131 |
| 1.609999999999903 | 0.595 | 0.254 | 0.132 |
| 1.614999999999903 | 0.599 | 0.256 | 0.133 |
| 1.619999999999903 | 0.602 | 0.258 | 0.135 |
| 1.624999999999903 | 0.606 | 0.26 | 0.136 |
| 1.629999999999903 | 0.609 | 0.262 | 0.137 |
| 1.634999999999903 | 0.613 | 0.264 | 0.138 |
| 1.639999999999903 | 0.617 | 0.266 | 0.139 |
| 1.644999999999902 | 0.62 | 0.268 | 0.14 |
| 1.649999999999902 | 0.624 | 0.27 | 0.141 |
| 1.654999999999902 | 0.628 | 0.272 | 0.143 |
| 1.659999999999902 | 0.631 | 0.274 | 0.144 |
| 1.664999999999902 | 0.635 | 0.277 | 0.145 |
| 1.669999999999902 | 0.639 | 0.279 | 0.146 |
| 1.674999999999902 | 0.642 | 0.281 | 0.147 |
| 1.679999999999902 | 0.646 | 0.283 | 0.149 |
| 1.684999999999902 | 0.65 | 0.285 | 0.15 |
| 1.689999999999901 | 0.654 | 0.287 | 0.151 |
| 1.694999999999901 | 0.657 | 0.289 | 0.152 |
| 1.699999999999901 | 0.661 | 0.291 | 0.153 |
| 1.704999999999901 | 0.665 | 0.293 | 0.155 |
| 1.709999999999901 | 0.668 | 0.295 | 0.156 |
| 1.714999999999901 | 0.672 | 0.297 | 0.157 |
| 1.719999999999901 | 0.676 | 0.299 | 0.158 |
| 1.724999999999901 | 0.68 | 0.302 | 0.159 |
| 1.729999999999901 | 0.683 | 0.304 | 0.161 |
| 1.734999999999901 | 0.687 | 0.306 | 0.162 |
| 1.7399999999999 | 0.691 | 0.308 | 0.163 |
| 1.7449999999999 | 0.695 | 0.31 | 0.165 |
| 1.7499999999999 | 0.698 | 0.312 | 0.166 |
| 1.7549999999999 | 0.702 | 0.315 | 0.167 |
| 1.7599999999999 | 0.706 | 0.317 | 0.168 |
| 1.7649999999999 | 0.71 | 0.319 | 0.17 |
| 1.7699999999999 | 0.713 | 0.321 | 0.171 |
| 1.7749999999999 | 0.717 | 0.323 | 0.172 |
| 1.7799999999999 | 0.721 | 0.325 | 0.173 |
| 1.784999999999899 | 0.725 | 0.328 | 0.175 |
| 1.789999999999899 | 0.729 | 0.33 | 0.176 |
| 1.794999999999899 | 0.732 | 0.332 | 0.177 |
| 1.799999999999899 | 0.736 | 0.334 | 0.179 |
| 1.804999999999899 | 0.74 | 0.337 | 0.18 |
| 1.809999999999899 | 0.744 | 0.339 | 0.181 |
| 1.814999999999899 | 0.748 | 0.341 | 0.183 |
| 1.819999999999899 | 0.752 | 0.343 | 0.184 |
| 1.824999999999899 | 0.755 | 0.346 | 0.185 |
| 1.829999999999899 | 0.759 | 0.348 | 0.187 |
| 1.834999999999898 | 0.763 | 0.35 | 0.188 |
| 1.839999999999898 | 0.767 | 0.352 | 0.19 |
| 1.844999999999898 | 0.771 | 0.355 | 0.191 |
| 1.849999999999898 | 0.775 | 0.357 | 0.192 |
| 1.854999999999898 | 0.779 | 0.359 | 0.194 |
| 1.859999999999898 | 0.783 | 0.362 | 0.195 |
| 1.864999999999898 | 0.786 | 0.364 | 0.196 |
| 1.869999999999898 | 0.79 | 0.366 | 0.198 |
| 1.874999999999898 | 0.794 | 0.369 | 0.199 |
| 1.879999999999897 | 0.798 | 0.371 | 0.201 |
| 1.884999999999897 | 0.802 | 0.373 | 0.202 |
| 1.889999999999897 | 0.806 | 0.376 | 0.203 |
| 1.894999999999897 | 0.81 | 0.378 | 0.205 |
| 1.899999999999897 | 0.814 | 0.38 | 0.206 |
| 1.904999999999897 | 0.818 | 0.383 | 0.208 |
| 1.909999999999897 | 0.822 | 0.385 | 0.209 |
| 1.914999999999897 | 0.825 | 0.388 | 0.211 |
| 1.919999999999897 | 0.829 | 0.39 | 0.212 |
| 1.924999999999897 | 0.833 | 0.392 | 0.214 |
| 1.929999999999896 | 0.837 | 0.395 | 0.215 |
| 1.934999999999896 | 0.841 | 0.397 | 0.216 |
| 1.939999999999896 | 0.845 | 0.4 | 0.218 |
| 1.944999999999896 | 0.849 | 0.402 | 0.219 |
| 1.949999999999896 | 0.853 | 0.405 | 0.221 |
| 1.954999999999896 | 0.857 | 0.407 | 0.222 |
| 1.959999999999896 | 0.861 | 0.409 | 0.224 |
| 1.964999999999896 | 0.865 | 0.412 | 0.225 |
| 1.969999999999896 | 0.869 | 0.414 | 0.227 |
| 1.974999999999895 | 0.873 | 0.417 | 0.228 |
| 1.979999999999895 | 0.877 | 0.419 | 0.23 |
| 1.984999999999895 | 0.881 | 0.422 | 0.231 |
| 1.989999999999895 | 0.885 | 0.424 | 0.233 |
| 1.994999999999895 | 0.889 | 0.427 | 0.234 |
| 1.999999999999895 | 0.893 | 0.429 | 0.236 |
| 2.004999999999895 | 0.897 | 0.432 | 0.238 |
| 2.009999999999895 | 0.901 | 0.434 | 0.239 |
| 2.014999999999895 | 0.905 | 0.437 | 0.241 |
| 2.019999999999895 | 0.909 | 0.439 | 0.242 |
| 2.024999999999895 | 0.913 | 0.442 | 0.244 |
| 2.029999999999895 | 0.917 | 0.444 | 0.245 |
| 2.034999999999894 | 0.921 | 0.447 | 0.247 |
| 2.039999999999894 | 0.925 | 0.449 | 0.248 |
| 2.044999999999894 | 0.929 | 0.452 | 0.25 |
| 2.049999999999894 | 0.933 | 0.455 | 0.252 |
| 2.054999999999894 | 0.937 | 0.457 | 0.253 |
| 2.059999999999894 | 0.941 | 0.46 | 0.255 |
| 2.064999999999894 | 0.945 | 0.462 | 0.256 |
| 2.069999999999894 | 0.949 | 0.465 | 0.258 |
| 2.074999999999894 | 0.953 | 0.467 | 0.26 |
| 2.079999999999893 | 0.957 | 0.47 | 0.261 |
| 2.084999999999893 | 0.961 | 0.473 | 0.263 |
| 2.089999999999893 | 0.965 | 0.475 | 0.265 |
| 2.094999999999893 | 0.97 | 0.478 | 0.266 |
| 2.099999999999893 | 0.974 | 0.48 | 0.268 |
| 2.104999999999893 | 0.978 | 0.483 | 0.269 |
| 2.109999999999893 | 0.982 | 0.486 | 0.271 |
| 2.114999999999893 | 0.986 | 0.488 | 0.273 |
| 2.119999999999893 | 0.99 | 0.491 | 0.274 |
| 2.124999999999893 | 0.994 | 0.494 | 0.276 |
| 2.129999999999892 | 0.998 | 0.496 | 0.278 |
| 2.134999999999892 | 1.002 | 0.499 | 0.279 |
| 2.139999999999892 | 1.006 | 0.502 | 0.281 |
| 2.144999999999892 | 1.01 | 0.504 | 0.283 |
| 2.149999999999892 | 1.015 | 0.507 | 0.285 |
| 2.154999999999892 | 1.019 | 0.51 | 0.286 |
| 2.159999999999892 | 1.023 | 0.512 | 0.288 |
| 2.164999999999892 | 1.027 | 0.515 | 0.29 |
| 2.169999999999892 | 1.031 | 0.518 | 0.291 |
| 2.174999999999891 | 1.035 | 0.52 | 0.293 |
| 2.179999999999891 | 1.039 | 0.523 | 0.295 |
| 2.184999999999891 | 1.043 | 0.526 | 0.297 |
| 2.189999999999891 | 1.048 | 0.529 | 0.298 |
| 2.194999999999891 | 1.052 | 0.531 | 0.3 |
| 2.199999999999891 | 1.056 | 0.534 | 0.302 |
| 2.204999999999891 | 1.06 | 0.537 | 0.304 |
| 2.209999999999891 | 1.064 | 0.54 | 0.305 |
| 2.214999999999891 | 1.068 | 0.542 | 0.307 |
| 2.21999999999989 | 1.072 | 0.545 | 0.309 |
| 2.22499999999989 | 1.077 | 0.548 | 0.311 |
| 2.22999999999989 | 1.081 | 0.551 | 0.312 |
| 2.23499999999989 | 1.085 | 0.553 | 0.314 |
| 2.23999999999989 | 1.089 | 0.556 | 0.316 |
| 2.24499999999989 | 1.093 | 0.559 | 0.318 |
| 2.24999999999989 | 1.097 | 0.562 | 0.319 |
| 2.25499999999989 | 1.102 | 0.564 | 0.321 |
| 2.25999999999989 | 1.106 | 0.567 | 0.323 |
| 2.26499999999989 | 1.11 | 0.57 | 0.325 |
| 2.269999999999889 | 1.114 | 0.573 | 0.327 |
| 2.274999999999889 | 1.118 | 0.576 | 0.329 |
| 2.279999999999889 | 1.123 | 0.579 | 0.33 |
| 2.284999999999889 | 1.127 | 0.581 | 0.332 |
| 2.289999999999889 | 1.131 | 0.584 | 0.334 |
| 2.294999999999889 | 1.135 | 0.587 | 0.336 |
| 2.299999999999889 | 1.139 | 0.59 | 0.338 |
| 2.304999999999889 | 1.144 | 0.593 | 0.34 |
| 2.309999999999889 | 1.148 | 0.596 | 0.341 |
| 2.314999999999888 | 1.152 | 0.598 | 0.343 |
| 2.319999999999888 | 1.156 | 0.601 | 0.345 |
| 2.324999999999888 | 1.16 | 0.604 | 0.347 |
| 2.329999999999888 | 1.165 | 0.607 | 0.349 |
| 2.334999999999888 | 1.169 | 0.61 | 0.351 |
| 2.339999999999888 | 1.173 | 0.613 | 0.353 |
| 2.344999999999888 | 1.177 | 0.616 | 0.355 |
| 2.349999999999888 | 1.182 | 0.619 | 0.357 |
| 2.354999999999888 | 1.186 | 0.622 | 0.358 |
| 2.359999999999887 | 1.19 | 0.624 | 0.36 |
| 2.364999999999887 | 1.194 | 0.627 | 0.362 |
| 2.369999999999887 | 1.198 | 0.63 | 0.364 |
| 2.374999999999887 | 1.203 | 0.633 | 0.366 |
| 2.379999999999887 | 1.207 | 0.636 | 0.368 |
| 2.384999999999887 | 1.211 | 0.639 | 0.37 |
| 2.389999999999887 | 1.215 | 0.642 | 0.372 |
| 2.394999999999887 | 1.22 | 0.645 | 0.374 |
| 2.399999999999887 | 1.224 | 0.648 | 0.376 |
| 2.404999999999887 | 1.228 | 0.651 | 0.378 |
| 2.409999999999886 | 1.233 | 0.654 | 0.38 |
| 2.414999999999886 | 1.237 | 0.657 | 0.382 |
| 2.419999999999886 | 1.241 | 0.66 | 0.384 |
| 2.424999999999886 | 1.245 | 0.663 | 0.386 |
| 2.429999999999886 | 1.25 | 0.666 | 0.388 |
| 2.434999999999886 | 1.254 | 0.669 | 0.39 |
| 2.439999999999886 | 1.258 | 0.672 | 0.392 |
| 2.444999999999886 | 1.262 | 0.675 | 0.394 |
| 2.449999999999886 | 1.267 | 0.678 | 0.396 |
| 2.454999999999885 | 1.271 | 0.681 | 0.398 |
| 2.459999999999885 | 1.275 | 0.684 | 0.4 |
| 2.464999999999885 | 1.28 | 0.687 | 0.402 |
| 2.469999999999885 | 1.284 | 0.69 | 0.404 |
| 2.474999999999885 | 1.288 | 0.693 | 0.406 |
| 2.479999999999885 | 1.292 | 0.696 | 0.408 |
| 2.484999999999885 | 1.297 | 0.699 | 0.41 |
| 2.489999999999885 | 1.301 | 0.702 | 0.412 |
| 2.494999999999885 | 1.305 | 0.705 | 0.414 |
| 2.499999999999884 | 1.31 | 0.708 | 0.416 |
| 2.504999999999884 | 1.314 | 0.711 | 0.418 |
| 2.509999999999884 | 1.318 | 0.714 | 0.42 |
| 2.514999999999884 | 1.323 | 0.717 | 0.422 |
| 2.519999999999884 | 1.327 | 0.72 | 0.424 |
| 2.524999999999884 | 1.331 | 0.723 | 0.426 |
| 2.529999999999884 | 1.336 | 0.726 | 0.428 |
| 2.534999999999884 | 1.34 | 0.729 | 0.43 |
| 2.539999999999884 | 1.344 | 0.732 | 0.432 |
| 2.544999999999884 | 1.349 | 0.736 | 0.434 |
| 2.549999999999883 | 1.353 | 0.739 | 0.437 |
| 2.554999999999883 | 1.357 | 0.742 | 0.439 |
| 2.559999999999883 | 1.362 | 0.745 | 0.441 |
| 2.564999999999883 | 1.366 | 0.748 | 0.443 |
| 2.569999999999883 | 1.37 | 0.751 | 0.445 |
| 2.574999999999883 | 1.375 | 0.754 | 0.447 |
| 2.579999999999883 | 1.379 | 0.757 | 0.449 |
| 2.584999999999883 | 1.383 | 0.76 | 0.451 |
| 2.589999999999883 | 1.388 | 0.764 | 0.453 |
| 2.594999999999882 | 1.392 | 0.767 | 0.456 |
| 2.599999999999882 | 1.396 | 0.77 | 0.458 |
| 2.604999999999882 | 1.401 | 0.773 | 0.46 |
| 2.609999999999882 | 1.405 | 0.776 | 0.462 |
| 2.614999999999882 | 1.409 | 0.779 | 0.464 |
| 2.619999999999882 | 1.414 | 0.782 | 0.466 |
| 2.624999999999882 | 1.418 | 0.786 | 0.469 |
| 2.629999999999882 | 1.423 | 0.789 | 0.471 |
| 2.634999999999882 | 1.427 | 0.792 | 0.473 |
| 2.639999999999881 | 1.431 | 0.795 | 0.475 |
| 2.644999999999881 | 1.436 | 0.798 | 0.477 |
| 2.649999999999881 | 1.44 | 0.801 | 0.479 |
| 2.654999999999881 | 1.444 | 0.805 | 0.482 |
| 2.659999999999881 | 1.449 | 0.808 | 0.484 |
| 2.664999999999881 | 1.453 | 0.811 | 0.486 |
| 2.669999999999881 | 1.458 | 0.814 | 0.488 |
| 2.674999999999881 | 1.462 | 0.817 | 0.49 |
| 2.679999999999881 | 1.466 | 0.821 | 0.493 |
| 2.68499999999988 | 1.471 | 0.824 | 0.495 |
| 2.68999999999988 | 1.475 | 0.827 | 0.497 |
| 2.69499999999988 | 1.48 | 0.83 | 0.499 |
| 2.69999999999988 | 1.484 | 0.834 | 0.502 |
| 2.70499999999988 | 1.488 | 0.837 | 0.504 |
| 2.70999999999988 | 1.493 | 0.84 | 0.506 |
| 2.71499999999988 | 1.497 | 0.843 | 0.508 |
| 2.71999999999988 | 1.502 | 0.846 | 0.511 |
| 2.72499999999988 | 1.506 | 0.85 | 0.513 |
| 2.72999999999988 | 1.51 | 0.853 | 0.515 |
| 2.734999999999879 | 1.515 | 0.856 | 0.517 |
| 2.739999999999879 | 1.519 | 0.859 | 0.52 |
| 2.744999999999879 | 1.524 | 0.863 | 0.522 |
| 2.749999999999879 | 1.528 | 0.866 | 0.524 |
| 2.754999999999879 | 1.532 | 0.869 | 0.526 |
| 2.759999999999879 | 1.537 | 0.873 | 0.529 |
| 2.764999999999879 | 1.541 | 0.876 | 0.531 |
| 2.769999999999879 | 1.546 | 0.879 | 0.533 |
| 2.774999999999879 | 1.55 | 0.882 | 0.536 |
| 2.779999999999878 | 1.555 | 0.886 | 0.538 |
| 2.784999999999878 | 1.559 | 0.889 | 0.54 |
| 2.789999999999878 | 1.563 | 0.892 | 0.543 |
| 2.794999999999878 | 1.568 | 0.896 | 0.545 |
| 2.799999999999878 | 1.572 | 0.899 | 0.547 |
| 2.804999999999878 | 1.577 | 0.902 | 0.55 |
| 2.809999999999878 | 1.581 | 0.906 | 0.552 |
| 2.814999999999878 | 1.586 | 0.909 | 0.554 |
| 2.819999999999878 | 1.59 | 0.912 | 0.557 |
| 2.824999999999878 | 1.594 | 0.916 | 0.559 |
| 2.829999999999877 | 1.599 | 0.919 | 0.561 |
| 2.834999999999877 | 1.603 | 0.922 | 0.564 |
| 2.839999999999877 | 1.608 | 0.926 | 0.566 |
| 2.844999999999877 | 1.612 | 0.929 | 0.568 |
| 2.849999999999877 | 1.617 | 0.932 | 0.571 |
| 2.854999999999877 | 1.621 | 0.936 | 0.573 |
| 2.859999999999877 | 1.626 | 0.939 | 0.575 |
| 2.864999999999877 | 1.63 | 0.942 | 0.578 |
| 2.869999999999877 | 1.634 | 0.946 | 0.58 |
| 2.874999999999876 | 1.639 | 0.949 | 0.583 |
| 2.879999999999876 | 1.643 | 0.952 | 0.585 |
| 2.884999999999876 | 1.648 | 0.956 | 0.587 |
| 2.889999999999876 | 1.652 | 0.959 | 0.59 |
| 2.894999999999876 | 1.657 | 0.963 | 0.592 |
| 2.899999999999876 | 1.661 | 0.966 | 0.595 |
| 2.904999999999876 | 1.666 | 0.969 | 0.597 |
| 2.909999999999876 | 1.67 | 0.973 | 0.599 |
| 2.914999999999876 | 1.675 | 0.976 | 0.602 |
| 2.919999999999876 | 1.679 | 0.979 | 0.604 |
| 2.924999999999875 | 1.684 | 0.983 | 0.607 |
| 2.929999999999875 | 1.688 | 0.986 | 0.609 |
| 2.934999999999875 | 1.693 | 0.99 | 0.612 |
| 2.939999999999875 | 1.697 | 0.993 | 0.614 |
| 2.944999999999875 | 1.702 | 0.997 | 0.617 |
| 2.949999999999875 | 1.706 | 1 | 0.619 |
| 2.954999999999875 | 1.711 | 1.003 | 0.621 |
| 2.959999999999875 | 1.715 | 1.007 | 0.624 |
| 2.964999999999875 | 1.719 | 1.01 | 0.626 |
| 2.969999999999874 | 1.724 | 1.014 | 0.629 |
| 2.974999999999874 | 1.728 | 1.017 | 0.631 |
| 2.979999999999874 | 1.733 | 1.021 | 0.634 |
| 2.984999999999874 | 1.737 | 1.024 | 0.636 |
| 2.989999999999874 | 1.742 | 1.027 | 0.639 |
| 2.994999999999874 | 1.746 | 1.031 | 0.641 |
| 2.999999999999874 | 1.751 | 1.034 | 0.644 |
| 3.004999999999874 | 1.755 | 1.038 | 0.646 |
| 3.009999999999874 | 1.76 | 1.041 | 0.649 |
| 3.014999999999874 | 1.764 | 1.045 | 0.651 |
| 3.019999999999873 | 1.769 | 1.048 | 0.654 |
| 3.024999999999873 | 1.773 | 1.052 | 0.656 |
| 3.029999999999873 | 1.778 | 1.055 | 0.659 |
| 3.034999999999873 | 1.782 | 1.059 | 0.661 |
| 3.039999999999873 | 1.787 | 1.062 | 0.664 |
| 3.044999999999873 | 1.792 | 1.066 | 0.666 |
| 3.049999999999873 | 1.796 | 1.069 | 0.669 |
| 3.054999999999873 | 1.801 | 1.073 | 0.672 |
| 3.059999999999873 | 1.805 | 1.076 | 0.674 |
| 3.064999999999872 | 1.81 | 1.08 | 0.677 |
| 3.069999999999872 | 1.814 | 1.083 | 0.679 |
| 3.074999999999872 | 1.819 | 1.087 | 0.682 |
| 3.079999999999872 | 1.823 | 1.09 | 0.684 |
| 3.084999999999872 | 1.828 | 1.094 | 0.687 |
| 3.089999999999872 | 1.832 | 1.097 | 0.689 |
| 3.094999999999872 | 1.837 | 1.101 | 0.692 |
| 3.099999999999872 | 1.841 | 1.104 | 0.695 |
| 3.104999999999872 | 1.846 | 1.108 | 0.697 |
| 3.109999999999872 | 1.85 | 1.111 | 0.7 |
| 3.114999999999871 | 1.855 | 1.115 | 0.702 |
| 3.119999999999871 | 1.859 | 1.118 | 0.705 |
| 3.124999999999871 | 1.864 | 1.122 | 0.708 |
| 3.129999999999871 | 1.868 | 1.126 | 0.71 |
| 3.134999999999871 | 1.873 | 1.129 | 0.713 |
| 3.139999999999871 | 1.878 | 1.133 | 0.715 |
| 3.144999999999871 | 1.882 | 1.136 | 0.718 |
| 3.149999999999871 | 1.887 | 1.14 | 0.721 |
| 3.154999999999871 | 1.891 | 1.143 | 0.723 |
| 3.15999999999987 | 1.896 | 1.147 | 0.726 |
| 3.16499999999987 | 1.9 | 1.151 | 0.729 |
| 3.16999999999987 | 1.905 | 1.154 | 0.731 |
| 3.17499999999987 | 1.909 | 1.158 | 0.734 |
| 3.17999999999987 | 1.914 | 1.161 | 0.736 |
| 3.18499999999987 | 1.918 | 1.165 | 0.739 |
| 3.18999999999987 | 1.923 | 1.168 | 0.742 |
| 3.19499999999987 | 1.928 | 1.172 | 0.744 |
| 3.19999999999987 | 1.932 | 1.176 | 0.747 |
| 3.204999999999869 | 1.937 | 1.179 | 0.75 |
| 3.209999999999869 | 1.941 | 1.183 | 0.752 |
| 3.214999999999869 | 1.946 | 1.186 | 0.755 |
| 3.219999999999869 | 1.95 | 1.19 | 0.758 |
| 3.224999999999869 | 1.955 | 1.194 | 0.76 |
| 3.229999999999869 | 1.959 | 1.197 | 0.763 |
| 3.234999999999869 | 1.964 | 1.201 | 0.766 |
| 3.239999999999869 | 1.969 | 1.204 | 0.768 |
| 3.244999999999869 | 1.973 | 1.208 | 0.771 |
| 3.249999999999869 | 1.978 | 1.212 | 0.774 |
| 3.254999999999868 | 1.982 | 1.215 | 0.777 |
| 3.259999999999868 | 1.987 | 1.219 | 0.779 |
| 3.264999999999868 | 1.991 | 1.223 | 0.782 |
| 3.269999999999868 | 1.996 | 1.226 | 0.785 |
| 3.274999999999868 | 2.001 | 1.23 | 0.787 |
| 3.279999999999868 | 2.005 | 1.234 | 0.79 |
| 3.284999999999868 | 2.01 | 1.237 | 0.793 |
| 3.289999999999868 | 2.014 | 1.241 | 0.796 |
| 3.294999999999868 | 2.019 | 1.244 | 0.798 |
| 3.299999999999867 | 2.023 | 1.248 | 0.801 |
| 3.304999999999867 | 2.028 | 1.252 | 0.804 |
| 3.309999999999867 | 2.033 | 1.255 | 0.807 |
| 3.314999999999867 | 2.037 | 1.259 | 0.809 |
| 3.319999999999867 | 2.042 | 1.263 | 0.812 |
| 3.324999999999867 | 2.046 | 1.266 | 0.815 |
| 3.329999999999867 | 2.051 | 1.27 | 0.818 |
| 3.334999999999867 | 2.056 | 1.274 | 0.82 |
| 3.339999999999867 | 2.06 | 1.277 | 0.823 |
| 3.344999999999866 | 2.065 | 1.281 | 0.826 |
| 3.349999999999866 | 2.069 | 1.285 | 0.829 |
| 3.354999999999866 | 2.074 | 1.289 | 0.831 |
| 3.359999999999866 | 2.078 | 1.292 | 0.834 |
| 3.364999999999866 | 2.083 | 1.296 | 0.837 |
| 3.369999999999866 | 2.088 | 1.3 | 0.84 |
| 3.374999999999866 | 2.092 | 1.303 | 0.843 |
| 3.379999999999866 | 2.097 | 1.307 | 0.845 |
| 3.384999999999866 | 2.101 | 1.311 | 0.848 |
| 3.389999999999866 | 2.106 | 1.314 | 0.851 |
| 3.394999999999865 | 2.111 | 1.318 | 0.854 |
| 3.399999999999865 | 2.115 | 1.322 | 0.857 |
| 3.404999999999865 | 2.12 | 1.326 | 0.859 |
| 3.409999999999865 | 2.124 | 1.329 | 0.862 |
| 3.414999999999865 | 2.129 | 1.333 | 0.865 |
| 3.419999999999865 | 2.134 | 1.337 | 0.868 |
| 3.424999999999865 | 2.138 | 1.34 | 0.871 |
| 3.429999999999865 | 2.143 | 1.344 | 0.873 |
| 3.434999999999865 | 2.147 | 1.348 | 0.876 |
| 3.439999999999864 | 2.152 | 1.352 | 0.879 |
| 3.444999999999864 | 2.157 | 1.355 | 0.882 |
| 3.449999999999864 | 2.161 | 1.359 | 0.885 |
| 3.454999999999864 | 2.166 | 1.363 | 0.888 |
| 3.459999999999864 | 2.171 | 1.367 | 0.891 |
| 3.464999999999864 | 2.175 | 1.37 | 0.893 |
| 3.469999999999864 | 2.18 | 1.374 | 0.896 |
| 3.474999999999864 | 2.184 | 1.378 | 0.899 |
| 3.479999999999864 | 2.189 | 1.382 | 0.902 |
| 3.484999999999864 | 2.194 | 1.385 | 0.905 |
| 3.489999999999863 | 2.198 | 1.389 | 0.908 |
| 3.494999999999863 | 2.203 | 1.393 | 0.911 |
| 3.499999999999863 | 2.208 | 1.397 | 0.913 |
| 3.504999999999863 | 2.212 | 1.4 | 0.916 |
| 3.509999999999863 | 2.217 | 1.404 | 0.919 |
| 3.514999999999863 | 2.221 | 1.408 | 0.922 |
| 3.519999999999863 | 2.226 | 1.412 | 0.925 |
| 3.524999999999863 | 2.231 | 1.416 | 0.928 |
| 3.529999999999863 | 2.235 | 1.419 | 0.931 |
| 3.534999999999862 | 2.24 | 1.423 | 0.934 |
| 3.539999999999862 | 2.245 | 1.427 | 0.937 |
| 3.544999999999862 | 2.249 | 1.431 | 0.94 |
| 3.549999999999862 | 2.254 | 1.435 | 0.942 |
| 3.554999999999862 | 2.258 | 1.438 | 0.945 |
| 3.559999999999862 | 2.263 | 1.442 | 0.948 |
| 3.564999999999862 | 2.268 | 1.446 | 0.951 |
| 3.569999999999862 | 2.272 | 1.45 | 0.954 |
| 3.574999999999862 | 2.277 | 1.454 | 0.957 |
| 3.579999999999862 | 2.282 | 1.457 | 0.96 |
| 3.584999999999861 | 2.286 | 1.461 | 0.963 |
| 3.589999999999861 | 2.291 | 1.465 | 0.966 |
| 3.594999999999861 | 2.296 | 1.469 | 0.969 |
| 3.599999999999861 | 2.3 | 1.473 | 0.972 |
| 3.604999999999861 | 2.305 | 1.476 | 0.975 |
| 3.609999999999861 | 2.309 | 1.48 | 0.978 |
| 3.614999999999861 | 2.314 | 1.484 | 0.981 |
| 3.619999999999861 | 2.319 | 1.488 | 0.984 |
| 3.62499999999986 | 2.323 | 1.492 | 0.987 |
| 3.62999999999986 | 2.328 | 1.496 | 0.99 |
| 3.63499999999986 | 2.333 | 1.499 | 0.993 |
| 3.63999999999986 | 2.337 | 1.503 | 0.996 |
| 3.64499999999986 | 2.342 | 1.507 | 0.999 |
| 3.64999999999986 | 2.347 | 1.511 | 1.002 |
| 3.65499999999986 | 2.351 | 1.515 | 1.004 |
| 3.65999999999986 | 2.356 | 1.519 | 1.007 |
| 3.66499999999986 | 2.361 | 1.522 | 1.01 |
| 3.669999999999859 | 2.365 | 1.526 | 1.013 |
| 3.674999999999859 | 2.37 | 1.53 | 1.016 |
| 3.679999999999859 | 2.375 | 1.534 | 1.019 |
| 3.684999999999859 | 2.379 | 1.538 | 1.022 |
| 3.689999999999859 | 2.384 | 1.542 | 1.025 |
| 3.694999999999859 | 2.389 | 1.546 | 1.028 |
| 3.699999999999859 | 2.393 | 1.55 | 1.032 |
| 3.704999999999859 | 2.398 | 1.553 | 1.035 |
| 3.709999999999859 | 2.402 | 1.557 | 1.038 |
| 3.714999999999859 | 2.407 | 1.561 | 1.041 |
| 3.719999999999858 | 2.412 | 1.565 | 1.044 |
| 3.724999999999858 | 2.416 | 1.569 | 1.047 |
| 3.729999999999858 | 2.421 | 1.573 | 1.05 |
| 3.734999999999858 | 2.426 | 1.577 | 1.053 |
| 3.739999999999858 | 2.43 | 1.581 | 1.056 |
| 3.744999999999858 | 2.435 | 1.584 | 1.059 |
| 3.749999999999858 | 2.44 | 1.588 | 1.062 |
| 3.754999999999858 | 2.444 | 1.592 | 1.065 |
| 3.759999999999858 | 2.449 | 1.596 | 1.068 |
| 3.764999999999857 | 2.454 | 1.6 | 1.071 |
| 3.769999999999857 | 2.458 | 1.604 | 1.074 |
| 3.774999999999857 | 2.463 | 1.608 | 1.077 |
| 3.779999999999857 | 2.468 | 1.612 | 1.08 |
| 3.784999999999857 | 2.473 | 1.616 | 1.083 |
| 3.789999999999857 | 2.477 | 1.62 | 1.086 |
| 3.794999999999857 | 2.482 | 1.623 | 1.089 |
| 3.799999999999857 | 2.487 | 1.627 | 1.092 |
| 3.804999999999857 | 2.491 | 1.631 | 1.096 |
| 3.809999999999857 | 2.496 | 1.635 | 1.099 |
| 3.814999999999856 | 2.501 | 1.639 | 1.102 |
| 3.819999999999856 | 2.505 | 1.643 | 1.105 |
| 3.824999999999856 | 2.51 | 1.647 | 1.108 |
| 3.829999999999856 | 2.515 | 1.651 | 1.111 |
| 3.834999999999856 | 2.519 | 1.655 | 1.114 |
| 3.839999999999856 | 2.524 | 1.659 | 1.117 |
| 3.844999999999856 | 2.529 | 1.663 | 1.12 |
| 3.849999999999856 | 2.533 | 1.667 | 1.123 |
| 3.854999999999856 | 2.538 | 1.671 | 1.127 |
| 3.859999999999855 | 2.543 | 1.675 | 1.13 |
| 3.864999999999855 | 2.547 | 1.678 | 1.133 |
| 3.869999999999855 | 2.552 | 1.682 | 1.136 |
| 3.874999999999855 | 2.557 | 1.686 | 1.139 |
| 3.879999999999855 | 2.561 | 1.69 | 1.142 |
| 3.884999999999855 | 2.566 | 1.694 | 1.145 |
| 3.889999999999855 | 2.571 | 1.698 | 1.148 |
| 3.894999999999855 | 2.576 | 1.702 | 1.152 |
| 3.899999999999855 | 2.58 | 1.706 | 1.155 |
| 3.904999999999855 | 2.585 | 1.71 | 1.158 |
| 3.909999999999854 | 2.59 | 1.714 | 1.161 |
| 3.914999999999854 | 2.594 | 1.718 | 1.164 |
| 3.919999999999854 | 2.599 | 1.722 | 1.167 |
| 3.924999999999854 | 2.604 | 1.726 | 1.17 |
| 3.929999999999854 | 2.608 | 1.73 | 1.174 |
| 3.934999999999854 | 2.613 | 1.734 | 1.177 |
| 3.939999999999854 | 2.618 | 1.738 | 1.18 |
| 3.944999999999854 | 2.622 | 1.742 | 1.183 |
| 3.949999999999854 | 2.627 | 1.746 | 1.186 |
| 3.954999999999853 | 2.632 | 1.75 | 1.189 |
| 3.959999999999853 | 2.637 | 1.754 | 1.193 |
| 3.964999999999853 | 2.641 | 1.758 | 1.196 |
| 3.969999999999853 | 2.646 | 1.762 | 1.199 |
| 3.974999999999853 | 2.651 | 1.766 | 1.202 |
| 3.979999999999853 | 2.655 | 1.77 | 1.205 |
| 3.984999999999853 | 2.66 | 1.774 | 1.209 |
| 3.989999999999853 | 2.665 | 1.778 | 1.212 |
| 3.994999999999853 | 2.669 | 1.782 | 1.215 |
| 3.999999999999853 | 2.674 | 1.786 | 1.218 |
| 4.004999999999852 | 2.679 | 1.79 | 1.221 |
| 4.009999999999852 | 2.684 | 1.794 | 1.225 |
| 4.014999999999852 | 2.688 | 1.798 | 1.228 |
| 4.019999999999852 | 2.693 | 1.802 | 1.231 |
| 4.024999999999852 | 2.698 | 1.806 | 1.234 |
| 4.029999999999852 | 2.702 | 1.81 | 1.237 |
| 4.034999999999852 | 2.707 | 1.814 | 1.241 |
| 4.039999999999851 | 2.712 | 1.818 | 1.244 |
| 4.044999999999852 | 2.717 | 1.822 | 1.247 |
| 4.049999999999851 | 2.721 | 1.826 | 1.25 |
| 4.054999999999851 | 2.726 | 1.83 | 1.253 |
| 4.059999999999851 | 2.731 | 1.834 | 1.257 |
| 4.064999999999851 | 2.735 | 1.838 | 1.26 |
| 4.069999999999851 | 2.74 | 1.842 | 1.263 |
| 4.074999999999851 | 2.745 | 1.846 | 1.266 |
| 4.07999999999985 | 2.75 | 1.85 | 1.27 |
| 4.084999999999851 | 2.754 | 1.854 | 1.273 |
| 4.08999999999985 | 2.759 | 1.858 | 1.276 |
| 4.094999999999851 | 2.764 | 1.862 | 1.279 |
| 4.09999999999985 | 2.768 | 1.866 | 1.283 |
| 4.10499999999985 | 2.773 | 1.87 | 1.286 |
| 4.10999999999985 | 2.778 | 1.874 | 1.289 |
| 4.11499999999985 | 2.783 | 1.878 | 1.292 |
| 4.11999999999985 | 2.787 | 1.882 | 1.296 |
| 4.12499999999985 | 2.792 | 1.886 | 1.299 |
| 4.12999999999985 | 2.797 | 1.89 | 1.302 |
| 4.13499999999985 | 2.801 | 1.894 | 1.306 |
| 4.13999999999985 | 2.806 | 1.898 | 1.309 |
| 4.144999999999849 | 2.811 | 1.903 | 1.312 |
| 4.14999999999985 | 2.816 | 1.907 | 1.315 |
| 4.154999999999849 | 2.82 | 1.911 | 1.319 |
| 4.15999999999985 | 2.825 | 1.915 | 1.322 |
| 4.164999999999849 | 2.83 | 1.919 | 1.325 |
| 4.169999999999849 | 2.835 | 1.923 | 1.329 |
| 4.174999999999849 | 2.839 | 1.927 | 1.332 |
| 4.179999999999848 | 2.844 | 1.931 | 1.335 |
| 4.184999999999849 | 2.849 | 1.935 | 1.338 |
| 4.189999999999848 | 2.853 | 1.939 | 1.342 |
| 4.194999999999848 | 2.858 | 1.943 | 1.345 |
| 4.199999999999848 | 2.863 | 1.947 | 1.348 |
| 4.204999999999848 | 2.868 | 1.951 | 1.352 |
| 4.209999999999848 | 2.872 | 1.955 | 1.355 |
| 4.214999999999848 | 2.877 | 1.959 | 1.358 |
| 4.219999999999847 | 2.882 | 1.964 | 1.362 |
| 4.224999999999848 | 2.887 | 1.968 | 1.365 |
| 4.229999999999847 | 2.891 | 1.972 | 1.368 |
| 4.234999999999847 | 2.896 | 1.976 | 1.372 |
| 4.239999999999847 | 2.901 | 1.98 | 1.375 |
| 4.244999999999847 | 2.906 | 1.984 | 1.378 |
| 4.249999999999847 | 2.91 | 1.988 | 1.382 |
| 4.254999999999847 | 2.915 | 1.992 | 1.385 |
| 4.259999999999846 | 2.92 | 1.996 | 1.388 |
| 4.264999999999847 | 2.925 | 2 | 1.392 |
| 4.269999999999846 | 2.929 | 2.004 | 1.395 |
| 4.274999999999846 | 2.934 | 2.009 | 1.398 |
| 4.279999999999846 | 2.939 | 2.013 | 1.402 |
| 4.284999999999846 | 2.943 | 2.017 | 1.405 |
| 4.289999999999846 | 2.948 | 2.021 | 1.408 |
| 4.294999999999846 | 2.953 | 2.025 | 1.412 |
| 4.299999999999846 | 2.958 | 2.029 | 1.415 |
| 4.304999999999846 | 2.962 | 2.033 | 1.418 |
| 4.309999999999845 | 2.967 | 2.037 | 1.422 |
| 4.314999999999846 | 2.972 | 2.041 | 1.425 |
| 4.319999999999845 | 2.977 | 2.046 | 1.429 |
| 4.324999999999846 | 2.981 | 2.05 | 1.432 |
| 4.329999999999845 | 2.986 | 2.054 | 1.435 |
| 4.334999999999845 | 2.991 | 2.058 | 1.439 |
| 4.339999999999845 | 2.996 | 2.062 | 1.442 |
| 4.344999999999845 | 3 | 2.066 | 1.445 |
| 4.349999999999845 | 3.005 | 2.07 | 1.449 |
| 4.354999999999845 | 3.01 | 2.074 | 1.452 |
| 4.359999999999844 | 3.015 | 2.079 | 1.456 |
| 4.364999999999845 | 3.019 | 2.083 | 1.459 |
| 4.369999999999844 | 3.024 | 2.087 | 1.462 |
| 4.374999999999844 | 3.029 | 2.091 | 1.466 |
| 4.379999999999844 | 3.034 | 2.095 | 1.469 |
| 4.384999999999844 | 3.038 | 2.099 | 1.473 |
| 4.389999999999844 | 3.043 | 2.103 | 1.476 |
| 4.394999999999844 | 3.048 | 2.108 | 1.479 |
| 4.399999999999844 | 3.053 | 2.112 | 1.483 |
| 4.404999999999844 | 3.057 | 2.116 | 1.486 |
| 4.409999999999843 | 3.062 | 2.12 | 1.49 |
| 4.414999999999844 | 3.067 | 2.124 | 1.493 |
| 4.419999999999843 | 3.072 | 2.128 | 1.497 |
| 4.424999999999843 | 3.076 | 2.132 | 1.5 |
| 4.429999999999843 | 3.081 | 2.137 | 1.503 |
| 4.434999999999843 | 3.086 | 2.141 | 1.507 |
| 4.439999999999843 | 3.091 | 2.145 | 1.51 |
| 4.444999999999843 | 3.095 | 2.149 | 1.514 |
| 4.449999999999842 | 3.1 | 2.153 | 1.517 |
| 4.454999999999843 | 3.105 | 2.157 | 1.521 |
| 4.459999999999842 | 3.11 | 2.162 | 1.524 |
| 4.464999999999843 | 3.115 | 2.166 | 1.527 |
| 4.469999999999842 | 3.119 | 2.17 | 1.531 |
| 4.474999999999842 | 3.124 | 2.174 | 1.534 |
| 4.479999999999842 | 3.129 | 2.178 | 1.538 |
| 4.484999999999842 | 3.134 | 2.182 | 1.541 |
| 4.489999999999842 | 3.138 | 2.187 | 1.545 |
| 4.494999999999842 | 3.143 | 2.191 | 1.548 |
| 4.499999999999841 | 3.148 | 2.195 | 1.552 |
| 4.504999999999842 | 3.153 | 2.199 | 1.555 |
| 4.509999999999841 | 3.157 | 2.203 | 1.559 |
| 4.514999999999842 | 3.162 | 2.207 | 1.562 |
| 4.519999999999841 | 3.167 | 2.212 | 1.565 |
| 4.524999999999841 | 3.172 | 2.216 | 1.569 |
| 4.529999999999841 | 3.176 | 2.22 | 1.572 |
| 4.534999999999841 | 3.181 | 2.224 | 1.576 |
| 4.53999999999984 | 3.186 | 2.228 | 1.579 |
| 4.544999999999841 | 3.191 | 2.232 | 1.583 |
| 4.54999999999984 | 3.196 | 2.237 | 1.586 |
| 4.554999999999841 | 3.2 | 2.241 | 1.59 |
| 4.55999999999984 | 3.205 | 2.245 | 1.593 |
| 4.564999999999841 | 3.21 | 2.249 | 1.597 |
| 4.56999999999984 | 3.215 | 2.253 | 1.6 |
| 4.57499999999984 | 3.219 | 2.258 | 1.604 |
| 4.57999999999984 | 3.224 | 2.262 | 1.607 |
| 4.58499999999984 | 3.229 | 2.266 | 1.611 |
| 4.58999999999984 | 3.234 | 2.27 | 1.614 |
| 4.59499999999984 | 3.238 | 2.274 | 1.618 |
| 4.59999999999984 | 3.243 | 2.279 | 1.621 |
| 4.60499999999984 | 3.248 | 2.283 | 1.625 |
| 4.60999999999984 | 3.253 | 2.287 | 1.628 |
| 4.614999999999839 | 3.258 | 2.291 | 1.632 |
| 4.61999999999984 | 3.262 | 2.295 | 1.635 |
| 4.624999999999839 | 3.267 | 2.3 | 1.639 |
| 4.62999999999984 | 3.272 | 2.304 | 1.642 |
| 4.634999999999839 | 3.277 | 2.308 | 1.646 |
| 4.639999999999838 | 3.281 | 2.312 | 1.649 |
| 4.644999999999839 | 3.286 | 2.317 | 1.653 |
| 4.649999999999838 | 3.291 | 2.321 | 1.657 |
| 4.654999999999839 | 3.296 | 2.325 | 1.66 |
| 4.659999999999838 | 3.301 | 2.329 | 1.664 |
| 4.664999999999838 | 3.305 | 2.333 | 1.667 |
| 4.669999999999838 | 3.31 | 2.338 | 1.671 |
| 4.674999999999838 | 3.315 | 2.342 | 1.674 |
| 4.679999999999837 | 3.32 | 2.346 | 1.678 |
| 4.684999999999838 | 3.324 | 2.35 | 1.681 |
| 4.689999999999837 | 3.329 | 2.355 | 1.685 |
| 4.694999999999838 | 3.334 | 2.359 | 1.688 |
| 4.699999999999837 | 3.339 | 2.363 | 1.692 |
| 4.704999999999837 | 3.344 | 2.367 | 1.695 |
| 4.709999999999837 | 3.348 | 2.372 | 1.699 |
| 4.714999999999837 | 3.353 | 2.376 | 1.703 |
| 4.719999999999837 | 3.358 | 2.38 | 1.706 |
| 4.724999999999837 | 3.363 | 2.384 | 1.71 |
| 4.729999999999836 | 3.368 | 2.388 | 1.713 |
| 4.734999999999836 | 3.372 | 2.393 | 1.717 |
| 4.739999999999836 | 3.377 | 2.397 | 1.72 |
| 4.744999999999836 | 3.382 | 2.401 | 1.724 |
| 4.749999999999836 | 3.387 | 2.405 | 1.728 |
| 4.754999999999836 | 3.391 | 2.41 | 1.731 |
| 4.759999999999836 | 3.396 | 2.414 | 1.735 |
| 4.764999999999836 | 3.401 | 2.418 | 1.738 |
| 4.769999999999836 | 3.406 | 2.422 | 1.742 |
| 4.774999999999835 | 3.411 | 2.427 | 1.745 |
| 4.779999999999835 | 3.415 | 2.431 | 1.749 |
| 4.784999999999835 | 3.42 | 2.435 | 1.753 |
| 4.789999999999835 | 3.425 | 2.439 | 1.756 |
| 4.794999999999835 | 3.43 | 2.444 | 1.76 |
| 4.799999999999835 | 3.435 | 2.448 | 1.763 |
| 4.804999999999835 | 3.439 | 2.452 | 1.767 |
| 4.809999999999835 | 3.444 | 2.457 | 1.771 |
| 4.814999999999835 | 3.449 | 2.461 | 1.774 |
| 4.819999999999835 | 3.454 | 2.465 | 1.778 |
| 4.824999999999835 | 3.459 | 2.469 | 1.781 |
| 4.829999999999834 | 3.463 | 2.474 | 1.785 |
| 4.834999999999834 | 3.468 | 2.478 | 1.789 |
| 4.839999999999834 | 3.473 | 2.482 | 1.792 |
| 4.844999999999834 | 3.478 | 2.486 | 1.796 |
| 4.849999999999834 | 3.483 | 2.491 | 1.799 |
| 4.854999999999834 | 3.487 | 2.495 | 1.803 |
| 4.859999999999834 | 3.492 | 2.499 | 1.807 |
| 4.864999999999834 | 3.497 | 2.503 | 1.81 |
| 4.869999999999834 | 3.502 | 2.508 | 1.814 |
| 4.874999999999834 | 3.507 | 2.512 | 1.818 |
| 4.879999999999833 | 3.511 | 2.516 | 1.821 |
| 4.884999999999834 | 3.516 | 2.521 | 1.825 |
| 4.889999999999833 | 3.521 | 2.525 | 1.828 |
| 4.894999999999833 | 3.526 | 2.529 | 1.832 |
| 4.899999999999833 | 3.531 | 2.533 | 1.836 |
| 4.904999999999833 | 3.535 | 2.538 | 1.839 |
| 4.909999999999833 | 3.54 | 2.542 | 1.843 |
| 4.914999999999833 | 3.545 | 2.546 | 1.847 |
| 4.919999999999832 | 3.55 | 2.551 | 1.85 |
| 4.924999999999833 | 3.555 | 2.555 | 1.854 |
| 4.929999999999832 | 3.559 | 2.559 | 1.858 |
| 4.934999999999832 | 3.564 | 2.563 | 1.861 |
| 4.939999999999832 | 3.569 | 2.568 | 1.865 |
| 4.944999999999832 | 3.574 | 2.572 | 1.869 |
| 4.949999999999832 | 3.579 | 2.576 | 1.872 |
| 4.954999999999832 | 3.583 | 2.581 | 1.876 |
| 4.959999999999832 | 3.588 | 2.585 | 1.88 |
| 4.964999999999832 | 3.593 | 2.589 | 1.883 |
| 4.969999999999831 | 3.598 | 2.594 | 1.887 |
| 4.974999999999831 | 3.603 | 2.598 | 1.891 |
| 4.97999999999983 | 3.607 | 2.602 | 1.894 |
| 4.984999999999831 | 3.612 | 2.606 | 1.898 |
| 4.98999999999983 | 3.617 | 2.611 | 1.902 |
| 4.994999999999831 | 3.622 | 2.615 | 1.905 |
| 4.99999999999983 | 3.627 | 2.619 | 1.909 |